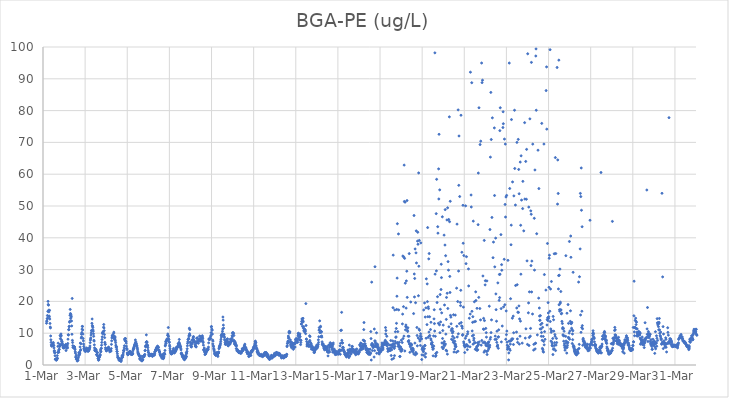
| Category | BGA-PE (ug/L) |
|---|---|
| 44621.166666666664 | 13.14 |
| 44621.177083333336 | 13.82 |
| 44621.1875 | 13.76 |
| 44621.197916666664 | 14.58 |
| 44621.208333333336 | 15.55 |
| 44621.21875 | 14.68 |
| 44621.229166666664 | 16.86 |
| 44621.239583333336 | 20.01 |
| 44621.25 | 19.02 |
| 44621.260416666664 | 18.82 |
| 44621.270833333336 | 17.22 |
| 44621.28125 | 16.7 |
| 44621.291666666664 | 15.41 |
| 44621.302083333336 | 15.15 |
| 44621.3125 | 17.2 |
| 44621.322916666664 | 14.45 |
| 44621.333333333336 | 13.07 |
| 44621.34375 | 11.94 |
| 44621.354166666664 | 11.66 |
| 44621.364583333336 | 9.13 |
| 44621.375 | 7.93 |
| 44621.385416666664 | 7.12 |
| 44621.395833333336 | 6.35 |
| 44621.40625 | 6.02 |
| 44621.416666666664 | 5.96 |
| 44621.427083333336 | 6.02 |
| 44621.4375 | 6.08 |
| 44621.447916666664 | 6.14 |
| 44621.458333333336 | 6.19 |
| 44621.46875 | 6.71 |
| 44621.479166666664 | 6.66 |
| 44621.489583333336 | 7.07 |
| 44621.5 | 6.17 |
| 44621.510416666664 | 6.14 |
| 44621.520833333336 | 5.37 |
| 44621.53125 | 4.37 |
| 44621.541666666664 | 4.5 |
| 44621.552083333336 | 3.82 |
| 44621.5625 | 3.89 |
| 44621.572916666664 | 2.91 |
| 44621.583333333336 | 1.82 |
| 44621.59375 | 1.84 |
| 44621.604166666664 | 1.74 |
| 44621.614583333336 | 1.61 |
| 44621.625 | 1.85 |
| 44621.635416666664 | 1.49 |
| 44621.645833333336 | 1.9 |
| 44621.65625 | 1.72 |
| 44621.666666666664 | 2.05 |
| 44621.677083333336 | 2.95 |
| 44621.6875 | 2.1 |
| 44621.697916666664 | 3.96 |
| 44621.708333333336 | 5.86 |
| 44621.71875 | 6.87 |
| 44621.729166666664 | 4.01 |
| 44621.739583333336 | 4.44 |
| 44621.75 | 3.99 |
| 44621.760416666664 | 4.83 |
| 44621.770833333336 | 4.95 |
| 44621.78125 | 5.85 |
| 44621.791666666664 | 5.84 |
| 44621.802083333336 | 6.48 |
| 44621.8125 | 9.28 |
| 44621.822916666664 | 8.28 |
| 44621.833333333336 | 6.27 |
| 44621.84375 | 8.97 |
| 44621.854166666664 | 9.76 |
| 44621.864583333336 | 9.25 |
| 44621.875 | 7.9 |
| 44621.885416666664 | 7.32 |
| 44621.895833333336 | 6.55 |
| 44621.90625 | 7.42 |
| 44621.916666666664 | 6.87 |
| 44621.927083333336 | 6.52 |
| 44621.9375 | 6.11 |
| 44621.947916666664 | 5.97 |
| 44621.958333333336 | 5.48 |
| 44621.96875 | 5.38 |
| 44621.979166666664 | 5.56 |
| 44621.989583333336 | 5.62 |
| 44622.0 | 5.34 |
| 44622.010416666664 | 5.61 |
| 44622.020833333336 | 5.76 |
| 44622.03125 | 6.1 |
| 44622.041666666664 | 6.15 |
| 44622.052083333336 | 5.9 |
| 44622.0625 | 6.12 |
| 44622.072916666664 | 5.97 |
| 44622.083333333336 | 6.5 |
| 44622.09375 | 4.55 |
| 44622.104166666664 | 5.55 |
| 44622.114583333336 | 5.6 |
| 44622.125 | 5.36 |
| 44622.135416666664 | 5.36 |
| 44622.145833333336 | 5.78 |
| 44622.15625 | 6.28 |
| 44622.166666666664 | 5.39 |
| 44622.177083333336 | 6.78 |
| 44622.1875 | 8.12 |
| 44622.197916666664 | 9.51 |
| 44622.208333333336 | 9.44 |
| 44622.21875 | 11.09 |
| 44622.229166666664 | 11.16 |
| 44622.239583333336 | 12.06 |
| 44622.25 | 12.17 |
| 44622.260416666664 | 13.46 |
| 44622.270833333336 | 13.74 |
| 44622.28125 | 15.63 |
| 44622.291666666664 | 17.48 |
| 44622.302083333336 | 16.19 |
| 44622.3125 | 14.64 |
| 44622.322916666664 | 15.94 |
| 44622.333333333336 | 15.03 |
| 44622.34375 | 15.36 |
| 44622.354166666664 | 13.84 |
| 44622.364583333336 | 12.29 |
| 44622.375 | 9.66 |
| 44622.385416666664 | 20.93 |
| 44622.395833333336 | 7.75 |
| 44622.40625 | 7.08 |
| 44622.416666666664 | 6.08 |
| 44622.427083333336 | 5.57 |
| 44622.4375 | 5.59 |
| 44622.447916666664 | 5.43 |
| 44622.458333333336 | 5.79 |
| 44622.46875 | 5.61 |
| 44622.479166666664 | 5.77 |
| 44622.489583333336 | 5.7 |
| 44622.5 | 5.64 |
| 44622.510416666664 | 5.07 |
| 44622.520833333336 | 4.86 |
| 44622.53125 | 4.16 |
| 44622.541666666664 | 3.73 |
| 44622.552083333336 | 2.49 |
| 44622.5625 | 2.49 |
| 44622.572916666664 | 3.1 |
| 44622.583333333336 | 1.8 |
| 44622.59375 | 2.07 |
| 44622.604166666664 | 1.9 |
| 44622.614583333336 | 1.9 |
| 44622.625 | 1.24 |
| 44622.635416666664 | 1.73 |
| 44622.645833333336 | 1.49 |
| 44622.65625 | 1.97 |
| 44622.666666666664 | 1.52 |
| 44622.677083333336 | 2.36 |
| 44622.6875 | 2.87 |
| 44622.697916666664 | 3.84 |
| 44622.708333333336 | 3.32 |
| 44622.71875 | 3.41 |
| 44622.729166666664 | 3.17 |
| 44622.739583333336 | 4.06 |
| 44622.75 | 3.73 |
| 44622.760416666664 | 5.67 |
| 44622.770833333336 | 6.89 |
| 44622.78125 | 4.6 |
| 44622.791666666664 | 4.83 |
| 44622.802083333336 | 6.67 |
| 44622.8125 | 8.48 |
| 44622.822916666664 | 9.7 |
| 44622.833333333336 | 8.81 |
| 44622.84375 | 10.22 |
| 44622.854166666664 | 11.28 |
| 44622.864583333336 | 12.15 |
| 44622.875 | 12.11 |
| 44622.885416666664 | 11.02 |
| 44622.895833333336 | 9.72 |
| 44622.90625 | 8.33 |
| 44622.916666666664 | 7.59 |
| 44622.927083333336 | 6.59 |
| 44622.9375 | 5.86 |
| 44622.947916666664 | 5.23 |
| 44622.958333333336 | 5.1 |
| 44622.96875 | 4.8 |
| 44622.979166666664 | 4.44 |
| 44622.989583333336 | 4.49 |
| 44623.0 | 5.07 |
| 44623.010416666664 | 5.01 |
| 44623.020833333336 | 4.23 |
| 44623.03125 | 4.49 |
| 44623.041666666664 | 4.61 |
| 44623.052083333336 | 4.63 |
| 44623.0625 | 4.55 |
| 44623.072916666664 | 5.35 |
| 44623.083333333336 | 5.06 |
| 44623.09375 | 4.83 |
| 44623.104166666664 | 4.59 |
| 44623.114583333336 | 4.55 |
| 44623.125 | 4.37 |
| 44623.135416666664 | 4.78 |
| 44623.145833333336 | 4.29 |
| 44623.15625 | 4.55 |
| 44623.166666666664 | 4.7 |
| 44623.177083333336 | 4.55 |
| 44623.1875 | 5 |
| 44623.197916666664 | 5.41 |
| 44623.208333333336 | 5.02 |
| 44623.21875 | 5.45 |
| 44623.229166666664 | 5.98 |
| 44623.239583333336 | 7.03 |
| 44623.25 | 7.82 |
| 44623.260416666664 | 8.21 |
| 44623.270833333336 | 8.53 |
| 44623.28125 | 9.42 |
| 44623.291666666664 | 10.09 |
| 44623.302083333336 | 10.76 |
| 44623.3125 | 10.92 |
| 44623.322916666664 | 13.1 |
| 44623.333333333336 | 14.47 |
| 44623.34375 | 12.4 |
| 44623.354166666664 | 12.16 |
| 44623.364583333336 | 11.79 |
| 44623.375 | 11.02 |
| 44623.385416666664 | 10.64 |
| 44623.395833333336 | 9.81 |
| 44623.40625 | 9.03 |
| 44623.416666666664 | 7.78 |
| 44623.427083333336 | 7.5 |
| 44623.4375 | 6.34 |
| 44623.447916666664 | 5.38 |
| 44623.458333333336 | 4.73 |
| 44623.46875 | 4.56 |
| 44623.479166666664 | 4.47 |
| 44623.489583333336 | 4.51 |
| 44623.5 | 4.7 |
| 44623.510416666664 | 4.96 |
| 44623.520833333336 | 4.77 |
| 44623.53125 | 4.41 |
| 44623.541666666664 | 3.22 |
| 44623.552083333336 | 3.32 |
| 44623.5625 | 4.04 |
| 44623.572916666664 | 3.94 |
| 44623.583333333336 | 3.85 |
| 44623.59375 | 2.87 |
| 44623.604166666664 | 2.71 |
| 44623.614583333336 | 2.04 |
| 44623.625 | 2.01 |
| 44623.635416666664 | 1.48 |
| 44623.645833333336 | 2.15 |
| 44623.65625 | 1.71 |
| 44623.666666666664 | 2.4 |
| 44623.677083333336 | 2.67 |
| 44623.6875 | 2.58 |
| 44623.697916666664 | 2.87 |
| 44623.708333333336 | 3.3 |
| 44623.71875 | 3.1 |
| 44623.729166666664 | 4.72 |
| 44623.739583333336 | 4.11 |
| 44623.75 | 4.3 |
| 44623.760416666664 | 5.16 |
| 44623.770833333336 | 5.27 |
| 44623.78125 | 6.22 |
| 44623.791666666664 | 7.1 |
| 44623.802083333336 | 8.02 |
| 44623.8125 | 8.86 |
| 44623.822916666664 | 9.88 |
| 44623.833333333336 | 10.27 |
| 44623.84375 | 10.06 |
| 44623.854166666664 | 10.14 |
| 44623.864583333336 | 10.54 |
| 44623.875 | 11.88 |
| 44623.885416666664 | 12.74 |
| 44623.895833333336 | 11.64 |
| 44623.90625 | 10.78 |
| 44623.916666666664 | 9.57 |
| 44623.927083333336 | 8.61 |
| 44623.9375 | 7.11 |
| 44623.947916666664 | 6.56 |
| 44623.958333333336 | 6.47 |
| 44623.96875 | 5.43 |
| 44623.979166666664 | 4.98 |
| 44623.989583333336 | 4.92 |
| 44624.0 | 4.45 |
| 44624.010416666664 | 4.72 |
| 44624.020833333336 | 4.48 |
| 44624.03125 | 4.73 |
| 44624.041666666664 | 5.05 |
| 44624.052083333336 | 5.1 |
| 44624.0625 | 5.19 |
| 44624.072916666664 | 5.33 |
| 44624.083333333336 | 5.18 |
| 44624.09375 | 5.2 |
| 44624.104166666664 | 5.26 |
| 44624.114583333336 | 5.64 |
| 44624.125 | 4.93 |
| 44624.135416666664 | 5.11 |
| 44624.145833333336 | 5.01 |
| 44624.15625 | 4.77 |
| 44624.166666666664 | 4.16 |
| 44624.177083333336 | 4.48 |
| 44624.1875 | 4.52 |
| 44624.197916666664 | 4.61 |
| 44624.208333333336 | 4.4 |
| 44624.21875 | 4.65 |
| 44624.229166666664 | 4.36 |
| 44624.239583333336 | 5.17 |
| 44624.25 | 6.48 |
| 44624.260416666664 | 7.6 |
| 44624.270833333336 | 8.51 |
| 44624.28125 | 9.14 |
| 44624.291666666664 | 8.74 |
| 44624.302083333336 | 9.27 |
| 44624.3125 | 9.42 |
| 44624.322916666664 | 9.12 |
| 44624.333333333336 | 9.26 |
| 44624.34375 | 8.71 |
| 44624.354166666664 | 9.97 |
| 44624.364583333336 | 10.32 |
| 44624.375 | 8.7 |
| 44624.385416666664 | 9.07 |
| 44624.395833333336 | 8.04 |
| 44624.40625 | 8.38 |
| 44624.416666666664 | 7.98 |
| 44624.427083333336 | 8.79 |
| 44624.4375 | 7.6 |
| 44624.447916666664 | 7.03 |
| 44624.458333333336 | 6.22 |
| 44624.46875 | 5.68 |
| 44624.479166666664 | 5.62 |
| 44624.489583333336 | 5.72 |
| 44624.5 | 4.98 |
| 44624.510416666664 | 4.28 |
| 44624.520833333336 | 4.22 |
| 44624.53125 | 3.53 |
| 44624.541666666664 | 2.85 |
| 44624.552083333336 | 2.4 |
| 44624.5625 | 2.43 |
| 44624.572916666664 | 2.17 |
| 44624.583333333336 | 2.1 |
| 44624.59375 | 2.1 |
| 44624.604166666664 | 1.77 |
| 44624.614583333336 | 1.52 |
| 44624.625 | 1.45 |
| 44624.635416666664 | 1.83 |
| 44624.645833333336 | 1.55 |
| 44624.65625 | 1.68 |
| 44624.666666666664 | 1.57 |
| 44624.677083333336 | 1.29 |
| 44624.6875 | 1.44 |
| 44624.697916666664 | 1.47 |
| 44624.708333333336 | 1.11 |
| 44624.71875 | 1.58 |
| 44624.729166666664 | 2.06 |
| 44624.739583333336 | 2.28 |
| 44624.75 | 2.76 |
| 44624.760416666664 | 2.92 |
| 44624.770833333336 | 2.48 |
| 44624.78125 | 2.5 |
| 44624.791666666664 | 3.21 |
| 44624.802083333336 | 3.12 |
| 44624.8125 | 3.8 |
| 44624.822916666664 | 4.59 |
| 44624.833333333336 | 4.42 |
| 44624.84375 | 4.61 |
| 44624.854166666664 | 5.37 |
| 44624.864583333336 | 6.05 |
| 44624.875 | 8.02 |
| 44624.885416666664 | 8.23 |
| 44624.895833333336 | 7.65 |
| 44624.90625 | 8.28 |
| 44624.916666666664 | 8.33 |
| 44624.927083333336 | 7.51 |
| 44624.9375 | 7.44 |
| 44624.947916666664 | 6.88 |
| 44624.958333333336 | 5.93 |
| 44624.96875 | 5.16 |
| 44624.979166666664 | 5.16 |
| 44624.989583333336 | 4.85 |
| 44625.0 | 3.81 |
| 44625.010416666664 | 3.6 |
| 44625.020833333336 | 3.24 |
| 44625.03125 | 3.31 |
| 44625.041666666664 | 3.26 |
| 44625.052083333336 | 3.76 |
| 44625.0625 | 3.74 |
| 44625.072916666664 | 3.6 |
| 44625.083333333336 | 3.97 |
| 44625.09375 | 3.74 |
| 44625.104166666664 | 4.26 |
| 44625.114583333336 | 4.02 |
| 44625.125 | 4.15 |
| 44625.135416666664 | 4.25 |
| 44625.145833333336 | 3.85 |
| 44625.15625 | 4.12 |
| 44625.166666666664 | 3.9 |
| 44625.177083333336 | 3.45 |
| 44625.1875 | 3.32 |
| 44625.197916666664 | 3.35 |
| 44625.208333333336 | 3.57 |
| 44625.21875 | 3.54 |
| 44625.229166666664 | 3.37 |
| 44625.239583333336 | 3.46 |
| 44625.25 | 3.38 |
| 44625.260416666664 | 3.7 |
| 44625.270833333336 | 4.47 |
| 44625.28125 | 4.99 |
| 44625.291666666664 | 4.99 |
| 44625.302083333336 | 5.34 |
| 44625.3125 | 5.2 |
| 44625.322916666664 | 5.65 |
| 44625.333333333336 | 5.9 |
| 44625.34375 | 6.28 |
| 44625.354166666664 | 6.09 |
| 44625.364583333336 | 6.49 |
| 44625.375 | 6.85 |
| 44625.385416666664 | 7.88 |
| 44625.395833333336 | 6.94 |
| 44625.40625 | 7.29 |
| 44625.416666666664 | 6.81 |
| 44625.427083333336 | 6.82 |
| 44625.4375 | 6.28 |
| 44625.447916666664 | 6.1 |
| 44625.458333333336 | 5.96 |
| 44625.46875 | 5.53 |
| 44625.479166666664 | 5.21 |
| 44625.489583333336 | 4.75 |
| 44625.5 | 4.14 |
| 44625.510416666664 | 3.83 |
| 44625.520833333336 | 3.63 |
| 44625.53125 | 3.37 |
| 44625.541666666664 | 3.48 |
| 44625.552083333336 | 3.14 |
| 44625.5625 | 2.89 |
| 44625.572916666664 | 2.86 |
| 44625.583333333336 | 2.9 |
| 44625.59375 | 2.1 |
| 44625.604166666664 | 1.79 |
| 44625.614583333336 | 1.86 |
| 44625.625 | 1.8 |
| 44625.635416666664 | 2.35 |
| 44625.645833333336 | 2.82 |
| 44625.65625 | 1.64 |
| 44625.666666666664 | 1.43 |
| 44625.677083333336 | 1.5 |
| 44625.6875 | 1.55 |
| 44625.697916666664 | 1.26 |
| 44625.708333333336 | 1.62 |
| 44625.71875 | 1.66 |
| 44625.729166666664 | 1.68 |
| 44625.739583333336 | 1.61 |
| 44625.75 | 2.71 |
| 44625.760416666664 | 2.43 |
| 44625.770833333336 | 2.73 |
| 44625.78125 | 2.87 |
| 44625.791666666664 | 2.7 |
| 44625.802083333336 | 2.63 |
| 44625.8125 | 3.12 |
| 44625.822916666664 | 3.13 |
| 44625.833333333336 | 3.34 |
| 44625.84375 | 4.5 |
| 44625.854166666664 | 4.61 |
| 44625.864583333336 | 5.91 |
| 44625.875 | 5.68 |
| 44625.885416666664 | 6.13 |
| 44625.895833333336 | 7.1 |
| 44625.90625 | 9.47 |
| 44625.916666666664 | 7.32 |
| 44625.927083333336 | 7.33 |
| 44625.9375 | 7.06 |
| 44625.947916666664 | 6.22 |
| 44625.958333333336 | 6.24 |
| 44625.96875 | 6.02 |
| 44625.979166666664 | 5.45 |
| 44625.989583333336 | 4.62 |
| 44626.0 | 4.05 |
| 44626.010416666664 | 3.9 |
| 44626.020833333336 | 3.36 |
| 44626.03125 | 2.9 |
| 44626.041666666664 | 2.9 |
| 44626.052083333336 | 3.01 |
| 44626.0625 | 2.93 |
| 44626.072916666664 | 2.99 |
| 44626.083333333336 | 3.31 |
| 44626.09375 | 3.31 |
| 44626.104166666664 | 3.27 |
| 44626.114583333336 | 3.16 |
| 44626.125 | 3.28 |
| 44626.135416666664 | 3.33 |
| 44626.145833333336 | 3.39 |
| 44626.15625 | 3.12 |
| 44626.166666666664 | 3.14 |
| 44626.177083333336 | 3.28 |
| 44626.1875 | 2.73 |
| 44626.197916666664 | 2.93 |
| 44626.208333333336 | 2.78 |
| 44626.21875 | 3.19 |
| 44626.229166666664 | 3.4 |
| 44626.239583333336 | 3.42 |
| 44626.25 | 3.26 |
| 44626.260416666664 | 3.37 |
| 44626.270833333336 | 3.39 |
| 44626.28125 | 3.36 |
| 44626.291666666664 | 3.08 |
| 44626.302083333336 | 3.65 |
| 44626.3125 | 4.2 |
| 44626.322916666664 | 4.19 |
| 44626.333333333336 | 4.37 |
| 44626.34375 | 4.86 |
| 44626.354166666664 | 4.72 |
| 44626.364583333336 | 4.59 |
| 44626.375 | 4.87 |
| 44626.385416666664 | 5.45 |
| 44626.395833333336 | 5.2 |
| 44626.40625 | 5.3 |
| 44626.416666666664 | 5.68 |
| 44626.427083333336 | 5.48 |
| 44626.4375 | 5.95 |
| 44626.447916666664 | 5.58 |
| 44626.458333333336 | 5.64 |
| 44626.46875 | 5.6 |
| 44626.479166666664 | 5.56 |
| 44626.489583333336 | 4.66 |
| 44626.5 | 4.69 |
| 44626.510416666664 | 4.71 |
| 44626.520833333336 | 4.17 |
| 44626.53125 | 4.24 |
| 44626.541666666664 | 4.07 |
| 44626.552083333336 | 3.49 |
| 44626.5625 | 3.41 |
| 44626.572916666664 | 3.1 |
| 44626.583333333336 | 3.12 |
| 44626.59375 | 2.94 |
| 44626.604166666664 | 2.63 |
| 44626.614583333336 | 2.86 |
| 44626.625 | 2.84 |
| 44626.635416666664 | 3.01 |
| 44626.645833333336 | 2.12 |
| 44626.65625 | 2.73 |
| 44626.666666666664 | 2.5 |
| 44626.677083333336 | 3.34 |
| 44626.6875 | 3.07 |
| 44626.697916666664 | 2.48 |
| 44626.708333333336 | 1.98 |
| 44626.71875 | 2.12 |
| 44626.729166666664 | 2.32 |
| 44626.739583333336 | 2.61 |
| 44626.75 | 3.35 |
| 44626.760416666664 | 3.75 |
| 44626.770833333336 | 3.55 |
| 44626.78125 | 3.36 |
| 44626.791666666664 | 4.58 |
| 44626.802083333336 | 6 |
| 44626.8125 | 6.26 |
| 44626.822916666664 | 7.32 |
| 44626.833333333336 | 6.8 |
| 44626.84375 | 6.89 |
| 44626.854166666664 | 7.64 |
| 44626.864583333336 | 7.6 |
| 44626.875 | 7.94 |
| 44626.885416666664 | 7.75 |
| 44626.895833333336 | 8.26 |
| 44626.90625 | 8.04 |
| 44626.916666666664 | 9.34 |
| 44626.927083333336 | 9.75 |
| 44626.9375 | 9.26 |
| 44626.947916666664 | 11.78 |
| 44626.958333333336 | 8.94 |
| 44626.96875 | 8.15 |
| 44626.979166666664 | 8 |
| 44626.989583333336 | 7.27 |
| 44627.0 | 7.09 |
| 44627.010416666664 | 6.23 |
| 44627.020833333336 | 5.78 |
| 44627.03125 | 5.13 |
| 44627.041666666664 | 4.57 |
| 44627.052083333336 | 4.09 |
| 44627.0625 | 4.02 |
| 44627.072916666664 | 3.64 |
| 44627.083333333336 | 3.58 |
| 44627.09375 | 3.45 |
| 44627.104166666664 | 3.54 |
| 44627.114583333336 | 3.8 |
| 44627.125 | 3.72 |
| 44627.135416666664 | 3.61 |
| 44627.145833333336 | 3.81 |
| 44627.15625 | 4.08 |
| 44627.166666666664 | 4.62 |
| 44627.177083333336 | 4.21 |
| 44627.1875 | 4.33 |
| 44627.197916666664 | 5.21 |
| 44627.208333333336 | 4.39 |
| 44627.21875 | 3.8 |
| 44627.229166666664 | 3.89 |
| 44627.239583333336 | 3.82 |
| 44627.25 | 4.33 |
| 44627.260416666664 | 4.54 |
| 44627.270833333336 | 4.04 |
| 44627.28125 | 4.3 |
| 44627.291666666664 | 4.34 |
| 44627.302083333336 | 4.83 |
| 44627.3125 | 4.59 |
| 44627.322916666664 | 5.42 |
| 44627.333333333336 | 5.47 |
| 44627.34375 | 5.01 |
| 44627.354166666664 | 5.45 |
| 44627.364583333336 | 5.69 |
| 44627.375 | 5.64 |
| 44627.385416666664 | 5.51 |
| 44627.395833333336 | 5.92 |
| 44627.40625 | 5.77 |
| 44627.416666666664 | 6.67 |
| 44627.427083333336 | 6.65 |
| 44627.4375 | 6.28 |
| 44627.447916666664 | 6.79 |
| 44627.458333333336 | 7.11 |
| 44627.46875 | 8.04 |
| 44627.479166666664 | 6.78 |
| 44627.489583333336 | 6.22 |
| 44627.5 | 6.32 |
| 44627.510416666664 | 5.77 |
| 44627.520833333336 | 5.6 |
| 44627.53125 | 5.88 |
| 44627.541666666664 | 5.18 |
| 44627.552083333336 | 4.76 |
| 44627.5625 | 3.64 |
| 44627.572916666664 | 3.78 |
| 44627.583333333336 | 3.31 |
| 44627.59375 | 3.48 |
| 44627.604166666664 | 3.11 |
| 44627.614583333336 | 2.58 |
| 44627.625 | 2.92 |
| 44627.635416666664 | 3 |
| 44627.645833333336 | 2.53 |
| 44627.65625 | 2.83 |
| 44627.666666666664 | 2.6 |
| 44627.677083333336 | 1.97 |
| 44627.6875 | 1.97 |
| 44627.697916666664 | 1.88 |
| 44627.708333333336 | 1.96 |
| 44627.71875 | 1.66 |
| 44627.729166666664 | 2.45 |
| 44627.739583333336 | 2.68 |
| 44627.75 | 2.23 |
| 44627.760416666664 | 2.04 |
| 44627.770833333336 | 2.45 |
| 44627.78125 | 2.26 |
| 44627.791666666664 | 3.22 |
| 44627.802083333336 | 3.85 |
| 44627.8125 | 2.66 |
| 44627.822916666664 | 3.74 |
| 44627.833333333336 | 4.29 |
| 44627.84375 | 5.1 |
| 44627.854166666664 | 6.04 |
| 44627.864583333336 | 6.79 |
| 44627.875 | 7.28 |
| 44627.885416666664 | 7.99 |
| 44627.895833333336 | 8.04 |
| 44627.90625 | 8.21 |
| 44627.916666666664 | 8.42 |
| 44627.927083333336 | 9.1 |
| 44627.9375 | 9.37 |
| 44627.947916666664 | 11.56 |
| 44627.958333333336 | 9.85 |
| 44627.96875 | 11.12 |
| 44627.979166666664 | 9.35 |
| 44627.989583333336 | 7.23 |
| 44628.0 | 6.2 |
| 44628.010416666664 | 6.94 |
| 44628.020833333336 | 6.9 |
| 44628.03125 | 5.79 |
| 44628.041666666664 | 5.64 |
| 44628.052083333336 | 5.87 |
| 44628.0625 | 6.53 |
| 44628.072916666664 | 7.83 |
| 44628.083333333336 | 7.9 |
| 44628.09375 | 6.89 |
| 44628.104166666664 | 7.16 |
| 44628.114583333336 | 7.97 |
| 44628.125 | 8.77 |
| 44628.135416666664 | 8.5 |
| 44628.145833333336 | 8.94 |
| 44628.15625 | 7.87 |
| 44628.166666666664 | 7.64 |
| 44628.177083333336 | 7.55 |
| 44628.1875 | 7.23 |
| 44628.197916666664 | 7.31 |
| 44628.208333333336 | 7.26 |
| 44628.21875 | 6.43 |
| 44628.229166666664 | 5.95 |
| 44628.239583333336 | 6.05 |
| 44628.25 | 5.79 |
| 44628.260416666664 | 5.85 |
| 44628.270833333336 | 5.67 |
| 44628.28125 | 6.83 |
| 44628.291666666664 | 7.25 |
| 44628.302083333336 | 8.38 |
| 44628.3125 | 8.44 |
| 44628.322916666664 | 8.55 |
| 44628.333333333336 | 7.53 |
| 44628.34375 | 7.24 |
| 44628.354166666664 | 7.19 |
| 44628.364583333336 | 6.91 |
| 44628.375 | 6.87 |
| 44628.385416666664 | 7.61 |
| 44628.395833333336 | 7.78 |
| 44628.40625 | 8.04 |
| 44628.416666666664 | 7.65 |
| 44628.427083333336 | 8 |
| 44628.4375 | 9.06 |
| 44628.447916666664 | 9.08 |
| 44628.458333333336 | 8.2 |
| 44628.46875 | 7.57 |
| 44628.479166666664 | 7.58 |
| 44628.489583333336 | 7.74 |
| 44628.5 | 7.64 |
| 44628.510416666664 | 7.56 |
| 44628.520833333336 | 8.55 |
| 44628.53125 | 8.56 |
| 44628.541666666664 | 8.42 |
| 44628.552083333336 | 8.95 |
| 44628.5625 | 9.2 |
| 44628.572916666664 | 8.72 |
| 44628.583333333336 | 8.26 |
| 44628.59375 | 7.44 |
| 44628.604166666664 | 7.03 |
| 44628.614583333336 | 6.25 |
| 44628.625 | 4.7 |
| 44628.635416666664 | 4.9 |
| 44628.645833333336 | 4.76 |
| 44628.65625 | 5.34 |
| 44628.666666666664 | 4.32 |
| 44628.677083333336 | 3.92 |
| 44628.6875 | 3.27 |
| 44628.697916666664 | 4.17 |
| 44628.708333333336 | 3.47 |
| 44628.71875 | 3.8 |
| 44628.729166666664 | 3.53 |
| 44628.739583333336 | 4.19 |
| 44628.75 | 3.97 |
| 44628.760416666664 | 4.92 |
| 44628.770833333336 | 4.41 |
| 44628.78125 | 4.56 |
| 44628.791666666664 | 4.56 |
| 44628.802083333336 | 4.79 |
| 44628.8125 | 4.72 |
| 44628.822916666664 | 4.72 |
| 44628.833333333336 | 4.99 |
| 44628.84375 | 5.01 |
| 44628.854166666664 | 5.63 |
| 44628.864583333336 | 6.96 |
| 44628.875 | 8.14 |
| 44628.885416666664 | 8.21 |
| 44628.895833333336 | 8.03 |
| 44628.90625 | 7.98 |
| 44628.916666666664 | 8.36 |
| 44628.927083333336 | 8.22 |
| 44628.9375 | 8.3 |
| 44628.947916666664 | 8.36 |
| 44628.958333333336 | 8.94 |
| 44628.96875 | 9.33 |
| 44628.979166666664 | 10.18 |
| 44628.989583333336 | 12.01 |
| 44629.0 | 12.11 |
| 44629.010416666664 | 11.3 |
| 44629.020833333336 | 10.91 |
| 44629.03125 | 11.03 |
| 44629.041666666664 | 9.73 |
| 44629.052083333336 | 7.85 |
| 44629.0625 | 6.63 |
| 44629.072916666664 | 7.51 |
| 44629.083333333336 | 6.04 |
| 44629.09375 | 5.76 |
| 44629.104166666664 | 5.18 |
| 44629.114583333336 | 4.86 |
| 44629.125 | 4.65 |
| 44629.135416666664 | 4.22 |
| 44629.145833333336 | 3.72 |
| 44629.15625 | 3.5 |
| 44629.166666666664 | 3.39 |
| 44629.177083333336 | 3.35 |
| 44629.1875 | 3.26 |
| 44629.197916666664 | 3.15 |
| 44629.208333333336 | 3 |
| 44629.21875 | 3.38 |
| 44629.229166666664 | 3.45 |
| 44629.239583333336 | 3.83 |
| 44629.25 | 3.7 |
| 44629.260416666664 | 3.85 |
| 44629.270833333336 | 3.25 |
| 44629.28125 | 3.05 |
| 44629.291666666664 | 3.03 |
| 44629.302083333336 | 2.69 |
| 44629.3125 | 3.96 |
| 44629.322916666664 | 3.66 |
| 44629.333333333336 | 3.77 |
| 44629.34375 | 4.12 |
| 44629.354166666664 | 5.13 |
| 44629.364583333336 | 5.37 |
| 44629.375 | 5.74 |
| 44629.385416666664 | 6.03 |
| 44629.395833333336 | 5.64 |
| 44629.40625 | 6.11 |
| 44629.416666666664 | 6.43 |
| 44629.427083333336 | 6.86 |
| 44629.4375 | 7.45 |
| 44629.447916666664 | 8.09 |
| 44629.458333333336 | 9.3 |
| 44629.46875 | 8.78 |
| 44629.479166666664 | 9.48 |
| 44629.489583333336 | 9.17 |
| 44629.5 | 9.3 |
| 44629.510416666664 | 9.9 |
| 44629.520833333336 | 10.6 |
| 44629.53125 | 11.34 |
| 44629.541666666664 | 15.09 |
| 44629.552083333336 | 14.12 |
| 44629.5625 | 12.55 |
| 44629.572916666664 | 11.6 |
| 44629.583333333336 | 9.69 |
| 44629.59375 | 9.5 |
| 44629.604166666664 | 8.97 |
| 44629.614583333336 | 8.61 |
| 44629.625 | 7.97 |
| 44629.635416666664 | 7.78 |
| 44629.645833333336 | 7.08 |
| 44629.65625 | 6.48 |
| 44629.666666666664 | 6.75 |
| 44629.677083333336 | 6.56 |
| 44629.6875 | 6.51 |
| 44629.697916666664 | 7.44 |
| 44629.708333333336 | 7.95 |
| 44629.71875 | 7.83 |
| 44629.729166666664 | 7.86 |
| 44629.739583333336 | 8.11 |
| 44629.75 | 7.14 |
| 44629.760416666664 | 8.23 |
| 44629.770833333336 | 7.41 |
| 44629.78125 | 6.16 |
| 44629.791666666664 | 6.01 |
| 44629.802083333336 | 6.71 |
| 44629.8125 | 6.21 |
| 44629.822916666664 | 6.56 |
| 44629.833333333336 | 6.82 |
| 44629.84375 | 7.25 |
| 44629.854166666664 | 6.92 |
| 44629.864583333336 | 6.61 |
| 44629.875 | 6.54 |
| 44629.885416666664 | 6.87 |
| 44629.895833333336 | 8.15 |
| 44629.90625 | 7.1 |
| 44629.916666666664 | 7.88 |
| 44629.927083333336 | 7.32 |
| 44629.9375 | 7.48 |
| 44629.947916666664 | 7.87 |
| 44629.958333333336 | 7.58 |
| 44629.96875 | 8.33 |
| 44629.979166666664 | 9.22 |
| 44629.989583333336 | 8.84 |
| 44630.0 | 10.18 |
| 44630.010416666664 | 9.93 |
| 44630.020833333336 | 9.91 |
| 44630.03125 | 10.17 |
| 44630.041666666664 | 9.89 |
| 44630.052083333336 | 7.77 |
| 44630.0625 | 9.28 |
| 44630.072916666664 | 7.33 |
| 44630.083333333336 | 7.57 |
| 44630.09375 | 6.64 |
| 44630.104166666664 | 6.63 |
| 44630.114583333336 | 6.53 |
| 44630.125 | 7.2 |
| 44630.135416666664 | 6.85 |
| 44630.145833333336 | 6.09 |
| 44630.15625 | 6.4 |
| 44630.166666666664 | 6.26 |
| 44630.177083333336 | 5.17 |
| 44630.1875 | 6 |
| 44630.197916666664 | 5.1 |
| 44630.208333333336 | 4.45 |
| 44630.21875 | 4.62 |
| 44630.229166666664 | 4.6 |
| 44630.239583333336 | 4.58 |
| 44630.25 | 4.4 |
| 44630.260416666664 | 4.53 |
| 44630.270833333336 | 4.17 |
| 44630.28125 | 4.34 |
| 44630.291666666664 | 3.94 |
| 44630.302083333336 | 3.87 |
| 44630.3125 | 4.14 |
| 44630.322916666664 | 4.19 |
| 44630.333333333336 | 3.92 |
| 44630.34375 | 4.02 |
| 44630.354166666664 | 3.76 |
| 44630.364583333336 | 3.85 |
| 44630.375 | 4.08 |
| 44630.385416666664 | 3.68 |
| 44630.395833333336 | 4.12 |
| 44630.40625 | 3.76 |
| 44630.416666666664 | 3.88 |
| 44630.427083333336 | 4.14 |
| 44630.4375 | 4.33 |
| 44630.447916666664 | 4.63 |
| 44630.458333333336 | 5.06 |
| 44630.46875 | 5.17 |
| 44630.479166666664 | 4.94 |
| 44630.489583333336 | 4.47 |
| 44630.5 | 4.84 |
| 44630.510416666664 | 4.7 |
| 44630.520833333336 | 4.99 |
| 44630.53125 | 5.16 |
| 44630.541666666664 | 5.28 |
| 44630.552083333336 | 5.71 |
| 44630.5625 | 6.08 |
| 44630.572916666664 | 6.24 |
| 44630.583333333336 | 6.55 |
| 44630.59375 | 5.65 |
| 44630.604166666664 | 5.3 |
| 44630.614583333336 | 5.32 |
| 44630.625 | 5.51 |
| 44630.635416666664 | 5.04 |
| 44630.645833333336 | 4.99 |
| 44630.65625 | 4.75 |
| 44630.666666666664 | 4.52 |
| 44630.677083333336 | 4.09 |
| 44630.6875 | 3.93 |
| 44630.697916666664 | 3.84 |
| 44630.708333333336 | 3.48 |
| 44630.71875 | 4 |
| 44630.729166666664 | 4.18 |
| 44630.739583333336 | 3.93 |
| 44630.75 | 3.83 |
| 44630.760416666664 | 3.36 |
| 44630.770833333336 | 2.65 |
| 44630.78125 | 2.77 |
| 44630.791666666664 | 3.25 |
| 44630.802083333336 | 3.21 |
| 44630.8125 | 3.52 |
| 44630.822916666664 | 3.04 |
| 44630.833333333336 | 3.47 |
| 44630.84375 | 2.99 |
| 44630.854166666664 | 3.08 |
| 44630.864583333336 | 3 |
| 44630.875 | 3.88 |
| 44630.885416666664 | 4.29 |
| 44630.895833333336 | 4.44 |
| 44630.90625 | 4.01 |
| 44630.916666666664 | 4.48 |
| 44630.927083333336 | 4.59 |
| 44630.9375 | 4.42 |
| 44630.947916666664 | 4.74 |
| 44630.958333333336 | 4.61 |
| 44630.96875 | 4.73 |
| 44630.979166666664 | 5.05 |
| 44630.989583333336 | 5.49 |
| 44631.0 | 5.2 |
| 44631.010416666664 | 5.73 |
| 44631.020833333336 | 5.3 |
| 44631.03125 | 5.76 |
| 44631.041666666664 | 6.02 |
| 44631.052083333336 | 6.33 |
| 44631.0625 | 6.82 |
| 44631.072916666664 | 7.36 |
| 44631.083333333336 | 7.52 |
| 44631.09375 | 7.08 |
| 44631.104166666664 | 6.99 |
| 44631.114583333336 | 6.14 |
| 44631.125 | 5.61 |
| 44631.135416666664 | 5.11 |
| 44631.145833333336 | 5.2 |
| 44631.15625 | 4.95 |
| 44631.166666666664 | 4.18 |
| 44631.177083333336 | 3.87 |
| 44631.1875 | 4.55 |
| 44631.197916666664 | 4.19 |
| 44631.208333333336 | 4.02 |
| 44631.21875 | 3.36 |
| 44631.229166666664 | 3.68 |
| 44631.239583333336 | 3.54 |
| 44631.25 | 3.57 |
| 44631.260416666664 | 3.2 |
| 44631.270833333336 | 3.1 |
| 44631.28125 | 2.98 |
| 44631.291666666664 | 3.25 |
| 44631.302083333336 | 3.2 |
| 44631.3125 | 3.04 |
| 44631.322916666664 | 2.97 |
| 44631.333333333336 | 2.92 |
| 44631.34375 | 3.13 |
| 44631.354166666664 | 2.97 |
| 44631.364583333336 | 2.87 |
| 44631.375 | 3.34 |
| 44631.385416666664 | 3.01 |
| 44631.395833333336 | 3.07 |
| 44631.40625 | 3.06 |
| 44631.416666666664 | 2.62 |
| 44631.427083333336 | 2.87 |
| 44631.4375 | 2.99 |
| 44631.447916666664 | 3.05 |
| 44631.458333333336 | 2.82 |
| 44631.46875 | 2.89 |
| 44631.479166666664 | 3.01 |
| 44631.489583333336 | 3.25 |
| 44631.5 | 3.61 |
| 44631.510416666664 | 3.59 |
| 44631.520833333336 | 3.21 |
| 44631.53125 | 3.95 |
| 44631.541666666664 | 3.61 |
| 44631.552083333336 | 3.7 |
| 44631.5625 | 3.09 |
| 44631.572916666664 | 3.6 |
| 44631.583333333336 | 3.84 |
| 44631.59375 | 3.95 |
| 44631.604166666664 | 3.46 |
| 44631.614583333336 | 3.56 |
| 44631.625 | 3.58 |
| 44631.635416666664 | 3.45 |
| 44631.645833333336 | 2.59 |
| 44631.65625 | 2.6 |
| 44631.666666666664 | 2.7 |
| 44631.677083333336 | 3.23 |
| 44631.6875 | 2.95 |
| 44631.697916666664 | 2.73 |
| 44631.708333333336 | 2.25 |
| 44631.71875 | 2.1 |
| 44631.729166666664 | 1.92 |
| 44631.739583333336 | 1.92 |
| 44631.75 | 1.79 |
| 44631.760416666664 | 1.76 |
| 44631.770833333336 | 2.02 |
| 44631.78125 | 2.03 |
| 44631.791666666664 | 2.18 |
| 44631.802083333336 | 2.47 |
| 44631.8125 | 2.43 |
| 44631.822916666664 | 2.53 |
| 44631.833333333336 | 2.77 |
| 44631.84375 | 3.01 |
| 44631.854166666664 | 3.02 |
| 44631.864583333336 | 2.12 |
| 44631.875 | 2.54 |
| 44631.885416666664 | 2.3 |
| 44631.895833333336 | 2.41 |
| 44631.90625 | 2.56 |
| 44631.916666666664 | 2.7 |
| 44631.927083333336 | 2.64 |
| 44631.9375 | 2.87 |
| 44631.947916666664 | 2.73 |
| 44631.958333333336 | 2.93 |
| 44631.96875 | 3.11 |
| 44631.979166666664 | 3.3 |
| 44631.989583333336 | 3.67 |
| 44632.0 | 2.77 |
| 44632.010416666664 | 3.41 |
| 44632.020833333336 | 3.07 |
| 44632.03125 | 3.35 |
| 44632.041666666664 | 3.05 |
| 44632.052083333336 | 3.45 |
| 44632.0625 | 3.6 |
| 44632.072916666664 | 3.94 |
| 44632.083333333336 | 3.68 |
| 44632.09375 | 3.94 |
| 44632.104166666664 | 3.85 |
| 44632.114583333336 | 3.57 |
| 44632.125 | 3.59 |
| 44632.135416666664 | 3.6 |
| 44632.145833333336 | 3.64 |
| 44632.15625 | 3.64 |
| 44632.166666666664 | 3.24 |
| 44632.177083333336 | 3.72 |
| 44632.1875 | 3.13 |
| 44632.197916666664 | 3.17 |
| 44632.208333333336 | 3.46 |
| 44632.21875 | 3.65 |
| 44632.229166666664 | 3.43 |
| 44632.239583333336 | 3.46 |
| 44632.25 | 3.39 |
| 44632.260416666664 | 3.15 |
| 44632.270833333336 | 3.04 |
| 44632.28125 | 2.87 |
| 44632.291666666664 | 2.91 |
| 44632.302083333336 | 2.57 |
| 44632.3125 | 2.59 |
| 44632.322916666664 | 2.2 |
| 44632.333333333336 | 2.46 |
| 44632.34375 | 2.42 |
| 44632.354166666664 | 2.49 |
| 44632.364583333336 | 2.48 |
| 44632.375 | 2.36 |
| 44632.385416666664 | 2.92 |
| 44632.395833333336 | 2.85 |
| 44632.40625 | 2.51 |
| 44632.416666666664 | 2.61 |
| 44632.427083333336 | 2.17 |
| 44632.4375 | 2.32 |
| 44632.447916666664 | 2.51 |
| 44632.458333333336 | 2.49 |
| 44632.46875 | 2.88 |
| 44632.479166666664 | 2.96 |
| 44632.489583333336 | 2.96 |
| 44632.5 | 2.87 |
| 44632.510416666664 | 2.79 |
| 44632.520833333336 | 2.59 |
| 44632.53125 | 3.02 |
| 44632.541666666664 | 2.89 |
| 44632.552083333336 | 2.76 |
| 44632.5625 | 3.33 |
| 44632.572916666664 | 3.35 |
| 44632.583333333336 | 5.79 |
| 44632.59375 | 6.06 |
| 44632.604166666664 | 6.76 |
| 44632.614583333336 | 6.9 |
| 44632.625 | 7.4 |
| 44632.635416666664 | 7.51 |
| 44632.645833333336 | 9.1 |
| 44632.65625 | 8.41 |
| 44632.666666666664 | 8.67 |
| 44632.677083333336 | 10.23 |
| 44632.6875 | 10.58 |
| 44632.697916666664 | 10.08 |
| 44632.708333333336 | 10.18 |
| 44632.71875 | 10.44 |
| 44632.729166666664 | 7.12 |
| 44632.739583333336 | 7.91 |
| 44632.75 | 6.33 |
| 44632.760416666664 | 6.99 |
| 44632.770833333336 | 7.34 |
| 44632.78125 | 5.87 |
| 44632.791666666664 | 5.83 |
| 44632.802083333336 | 5.42 |
| 44632.8125 | 6.14 |
| 44632.822916666664 | 6.6 |
| 44632.833333333336 | 6.86 |
| 44632.84375 | 6.89 |
| 44632.854166666664 | 6.1 |
| 44632.864583333336 | 6.83 |
| 44632.875 | 6.25 |
| 44632.885416666664 | 4.93 |
| 44632.895833333336 | 5.37 |
| 44632.90625 | 5.6 |
| 44632.916666666664 | 5.52 |
| 44632.927083333336 | 6.82 |
| 44632.9375 | 6.58 |
| 44632.947916666664 | 6.77 |
| 44632.958333333336 | 6.98 |
| 44632.96875 | 5.65 |
| 44632.979166666664 | 6.8 |
| 44632.989583333336 | 8.05 |
| 44633.0 | 7.58 |
| 44633.010416666664 | 7.92 |
| 44633.020833333336 | 8.32 |
| 44633.03125 | 7.96 |
| 44633.041666666664 | 7.33 |
| 44633.052083333336 | 7.97 |
| 44633.0625 | 7.17 |
| 44633.072916666664 | 7.55 |
| 44633.083333333336 | 7.12 |
| 44633.09375 | 8.19 |
| 44633.104166666664 | 9.15 |
| 44633.114583333336 | 9.84 |
| 44633.125 | 10.01 |
| 44633.135416666664 | 9.4 |
| 44633.145833333336 | 9.62 |
| 44633.15625 | 8.64 |
| 44633.166666666664 | 8.84 |
| 44633.177083333336 | 7.88 |
| 44633.1875 | 9.43 |
| 44633.197916666664 | 9.8 |
| 44633.208333333336 | 8.9 |
| 44633.21875 | 7.94 |
| 44633.229166666664 | 6.41 |
| 44633.239583333336 | 7.08 |
| 44633.25 | 7.74 |
| 44633.260416666664 | 12.89 |
| 44633.270833333336 | 12.89 |
| 44633.28125 | 13.71 |
| 44633.291666666664 | 14.48 |
| 44633.302083333336 | 13.53 |
| 44633.3125 | 14.5 |
| 44633.322916666664 | 12.13 |
| 44633.333333333336 | 13.93 |
| 44633.34375 | 14.69 |
| 44633.354166666664 | 13.59 |
| 44633.364583333336 | 11.55 |
| 44633.375 | 12.04 |
| 44633.385416666664 | 10.7 |
| 44633.395833333336 | 10.92 |
| 44633.40625 | 10.92 |
| 44633.416666666664 | 11.28 |
| 44633.427083333336 | 10.38 |
| 44633.4375 | 10.82 |
| 44633.447916666664 | 11.09 |
| 44633.458333333336 | 10.64 |
| 44633.46875 | 9.86 |
| 44633.479166666664 | 19.31 |
| 44633.489583333336 | 12.43 |
| 44633.5 | 8.15 |
| 44633.510416666664 | 8.12 |
| 44633.520833333336 | 7.35 |
| 44633.53125 | 5.94 |
| 44633.541666666664 | 6.42 |
| 44633.552083333336 | 6.83 |
| 44633.5625 | 6.62 |
| 44633.572916666664 | 6.1 |
| 44633.583333333336 | 6.49 |
| 44633.59375 | 6.25 |
| 44633.604166666664 | 6.34 |
| 44633.614583333336 | 5.84 |
| 44633.625 | 6.08 |
| 44633.635416666664 | 7.28 |
| 44633.645833333336 | 7.31 |
| 44633.65625 | 9.18 |
| 44633.666666666664 | 7.72 |
| 44633.677083333336 | 8.95 |
| 44633.6875 | 5.78 |
| 44633.697916666664 | 7.07 |
| 44633.708333333336 | 6.41 |
| 44633.71875 | 6.54 |
| 44633.729166666664 | 6.74 |
| 44633.739583333336 | 4.98 |
| 44633.75 | 5.83 |
| 44633.760416666664 | 6.1 |
| 44633.770833333336 | 5.34 |
| 44633.78125 | 5.31 |
| 44633.791666666664 | 4.98 |
| 44633.802083333336 | 5.5 |
| 44633.8125 | 5.39 |
| 44633.822916666664 | 4.98 |
| 44633.833333333336 | 5.41 |
| 44633.84375 | 4.64 |
| 44633.854166666664 | 4.67 |
| 44633.864583333336 | 4.09 |
| 44633.875 | 3.93 |
| 44633.885416666664 | 3.94 |
| 44633.895833333336 | 4.45 |
| 44633.90625 | 4.93 |
| 44633.916666666664 | 4.57 |
| 44633.927083333336 | 5.25 |
| 44633.9375 | 5.62 |
| 44633.947916666664 | 5.22 |
| 44633.958333333336 | 5.26 |
| 44633.96875 | 5.13 |
| 44633.979166666664 | 5.9 |
| 44633.989583333336 | 5.23 |
| 44634.0 | 6.3 |
| 44634.010416666664 | 5.69 |
| 44634.020833333336 | 5.36 |
| 44634.03125 | 5.72 |
| 44634.041666666664 | 5.84 |
| 44634.052083333336 | 6.33 |
| 44634.0625 | 6.46 |
| 44634.072916666664 | 7.92 |
| 44634.083333333336 | 7.09 |
| 44634.09375 | 8.88 |
| 44634.104166666664 | 10.95 |
| 44634.114583333336 | 11.75 |
| 44634.125 | 11.04 |
| 44634.135416666664 | 13.88 |
| 44634.145833333336 | 10.27 |
| 44634.15625 | 10.23 |
| 44634.166666666664 | 11.91 |
| 44634.177083333336 | 12.17 |
| 44634.1875 | 8.94 |
| 44634.197916666664 | 10.31 |
| 44634.208333333336 | 10.55 |
| 44634.21875 | 10.45 |
| 44634.229166666664 | 9.13 |
| 44634.239583333336 | 8.77 |
| 44634.25 | 7.29 |
| 44634.260416666664 | 6.4 |
| 44634.270833333336 | 6.69 |
| 44634.28125 | 6.66 |
| 44634.291666666664 | 6.27 |
| 44634.302083333336 | 6.56 |
| 44634.3125 | 6.12 |
| 44634.322916666664 | 5.74 |
| 44634.333333333336 | 5.27 |
| 44634.34375 | 5.65 |
| 44634.354166666664 | 5.07 |
| 44634.364583333336 | 4.77 |
| 44634.375 | 5.95 |
| 44634.385416666664 | 5.27 |
| 44634.395833333336 | 5.3 |
| 44634.40625 | 5.13 |
| 44634.416666666664 | 5.8 |
| 44634.427083333336 | 5.35 |
| 44634.4375 | 5.46 |
| 44634.447916666664 | 5.51 |
| 44634.458333333336 | 4.67 |
| 44634.46875 | 5.24 |
| 44634.479166666664 | 5.14 |
| 44634.489583333336 | 4.48 |
| 44634.5 | 5.86 |
| 44634.510416666664 | 4.06 |
| 44634.520833333336 | 4.1 |
| 44634.53125 | 2.86 |
| 44634.541666666664 | 4.2 |
| 44634.552083333336 | 4.14 |
| 44634.5625 | 3.99 |
| 44634.572916666664 | 6.31 |
| 44634.583333333336 | 4.65 |
| 44634.59375 | 5.42 |
| 44634.604166666664 | 4.1 |
| 44634.614583333336 | 6.24 |
| 44634.625 | 5.88 |
| 44634.635416666664 | 7 |
| 44634.645833333336 | 6.02 |
| 44634.65625 | 6.77 |
| 44634.666666666664 | 6.31 |
| 44634.677083333336 | 6.59 |
| 44634.6875 | 6.09 |
| 44634.697916666664 | 5.5 |
| 44634.708333333336 | 6.17 |
| 44634.71875 | 4.86 |
| 44634.729166666664 | 6.29 |
| 44634.739583333336 | 5.73 |
| 44634.75 | 4.05 |
| 44634.760416666664 | 5.16 |
| 44634.770833333336 | 6.45 |
| 44634.78125 | 6.91 |
| 44634.791666666664 | 4.31 |
| 44634.802083333336 | 4.24 |
| 44634.8125 | 3.99 |
| 44634.822916666664 | 4.53 |
| 44634.833333333336 | 4.94 |
| 44634.84375 | 4.32 |
| 44634.854166666664 | 3.81 |
| 44634.864583333336 | 3.66 |
| 44634.875 | 3.26 |
| 44634.885416666664 | 4.2 |
| 44634.895833333336 | 4.04 |
| 44634.90625 | 3.4 |
| 44634.916666666664 | 3.67 |
| 44634.927083333336 | 4.28 |
| 44634.9375 | 3.83 |
| 44634.947916666664 | 3.35 |
| 44634.958333333336 | 3.91 |
| 44634.96875 | 3.64 |
| 44634.979166666664 | 4.03 |
| 44634.989583333336 | 3.85 |
| 44635.0 | 3.63 |
| 44635.010416666664 | 4.15 |
| 44635.020833333336 | 3.42 |
| 44635.03125 | 3.77 |
| 44635.041666666664 | 3.48 |
| 44635.052083333336 | 4.5 |
| 44635.0625 | 4.15 |
| 44635.072916666664 | 4.71 |
| 44635.083333333336 | 4.42 |
| 44635.09375 | 4.74 |
| 44635.104166666664 | 6.03 |
| 44635.114583333336 | 3.37 |
| 44635.125 | 6.81 |
| 44635.135416666664 | 10.87 |
| 44635.145833333336 | 4.57 |
| 44635.15625 | 4.75 |
| 44635.166666666664 | 10.94 |
| 44635.177083333336 | 16.56 |
| 44635.1875 | 7.76 |
| 44635.197916666664 | 6.98 |
| 44635.208333333336 | 6.92 |
| 44635.21875 | 6.97 |
| 44635.229166666664 | 5.44 |
| 44635.239583333336 | 5.6 |
| 44635.25 | 5.5 |
| 44635.260416666664 | 4.96 |
| 44635.270833333336 | 4.46 |
| 44635.28125 | 4.61 |
| 44635.291666666664 | 4.25 |
| 44635.302083333336 | 4.15 |
| 44635.3125 | 4.05 |
| 44635.322916666664 | 3.47 |
| 44635.333333333336 | 3.37 |
| 44635.34375 | 3.48 |
| 44635.354166666664 | 3.32 |
| 44635.364583333336 | 2.98 |
| 44635.375 | 2.94 |
| 44635.385416666664 | 3.14 |
| 44635.395833333336 | 3.14 |
| 44635.40625 | 2.52 |
| 44635.416666666664 | 2.82 |
| 44635.427083333336 | 3.48 |
| 44635.4375 | 2.93 |
| 44635.447916666664 | 3.32 |
| 44635.458333333336 | 3.67 |
| 44635.46875 | 3.89 |
| 44635.479166666664 | 4.73 |
| 44635.489583333336 | 4.62 |
| 44635.5 | 3.51 |
| 44635.510416666664 | 3.93 |
| 44635.520833333336 | 2.34 |
| 44635.53125 | 2.89 |
| 44635.541666666664 | 6.26 |
| 44635.552083333336 | 4.11 |
| 44635.5625 | 2.83 |
| 44635.572916666664 | 5.01 |
| 44635.583333333336 | 4.38 |
| 44635.59375 | 4.36 |
| 44635.604166666664 | 4.35 |
| 44635.614583333336 | 3.59 |
| 44635.625 | 3.47 |
| 44635.635416666664 | 4.63 |
| 44635.645833333336 | 4.35 |
| 44635.65625 | 4.33 |
| 44635.666666666664 | 5.81 |
| 44635.677083333336 | 5.24 |
| 44635.6875 | 5.86 |
| 44635.697916666664 | 4.95 |
| 44635.708333333336 | 4.1 |
| 44635.71875 | 4.99 |
| 44635.729166666664 | 4.44 |
| 44635.739583333336 | 4.24 |
| 44635.75 | 4.45 |
| 44635.760416666664 | 4.67 |
| 44635.770833333336 | 4.07 |
| 44635.78125 | 4.67 |
| 44635.791666666664 | 3.77 |
| 44635.802083333336 | 4.28 |
| 44635.8125 | 4.43 |
| 44635.822916666664 | 4.24 |
| 44635.833333333336 | 4.76 |
| 44635.84375 | 3.22 |
| 44635.854166666664 | 3.4 |
| 44635.864583333336 | 4.36 |
| 44635.875 | 4.33 |
| 44635.885416666664 | 3.81 |
| 44635.895833333336 | 5.05 |
| 44635.90625 | 3.84 |
| 44635.916666666664 | 4.14 |
| 44635.927083333336 | 3.77 |
| 44635.9375 | 3.79 |
| 44635.947916666664 | 3.52 |
| 44635.958333333336 | 3.73 |
| 44635.96875 | 3.51 |
| 44635.979166666664 | 3.56 |
| 44635.989583333336 | 4.1 |
| 44636.0 | 4.05 |
| 44636.010416666664 | 3.93 |
| 44636.020833333336 | 4.4 |
| 44636.03125 | 6.33 |
| 44636.041666666664 | 4.68 |
| 44636.052083333336 | 4.86 |
| 44636.0625 | 6.04 |
| 44636.072916666664 | 5.94 |
| 44636.083333333336 | 6.91 |
| 44636.09375 | 6.72 |
| 44636.104166666664 | 5.56 |
| 44636.114583333336 | 5.41 |
| 44636.125 | 4.84 |
| 44636.135416666664 | 5.13 |
| 44636.145833333336 | 5.8 |
| 44636.15625 | 5.72 |
| 44636.166666666664 | 6.11 |
| 44636.177083333336 | 5.89 |
| 44636.1875 | 6.58 |
| 44636.197916666664 | 7.83 |
| 44636.208333333336 | 5.17 |
| 44636.21875 | 5.87 |
| 44636.229166666664 | 11.13 |
| 44636.239583333336 | 13.35 |
| 44636.25 | 7.62 |
| 44636.260416666664 | 7.5 |
| 44636.270833333336 | 6.51 |
| 44636.28125 | 6.13 |
| 44636.291666666664 | 6.69 |
| 44636.302083333336 | 6.05 |
| 44636.3125 | 5.51 |
| 44636.322916666664 | 5.95 |
| 44636.333333333336 | 4.94 |
| 44636.34375 | 4.72 |
| 44636.354166666664 | 4.81 |
| 44636.364583333336 | 4.74 |
| 44636.375 | 3.99 |
| 44636.385416666664 | 3.99 |
| 44636.395833333336 | 5.13 |
| 44636.40625 | 3.84 |
| 44636.416666666664 | 3.85 |
| 44636.427083333336 | 4.06 |
| 44636.4375 | 4.71 |
| 44636.447916666664 | 3.38 |
| 44636.458333333336 | 3.61 |
| 44636.46875 | 4.89 |
| 44636.479166666664 | 3.89 |
| 44636.489583333336 | 3.92 |
| 44636.5 | 3.57 |
| 44636.510416666664 | 3.91 |
| 44636.520833333336 | 3.28 |
| 44636.53125 | 4.96 |
| 44636.541666666664 | 3.75 |
| 44636.552083333336 | 3.68 |
| 44636.5625 | 10.51 |
| 44636.572916666664 | 8.31 |
| 44636.583333333336 | 1.56 |
| 44636.59375 | 6.27 |
| 44636.604166666664 | 26.06 |
| 44636.614583333336 | 6.62 |
| 44636.625 | 6.76 |
| 44636.635416666664 | 4.53 |
| 44636.645833333336 | 6.21 |
| 44636.65625 | 5.74 |
| 44636.666666666664 | 5.78 |
| 44636.677083333336 | 5.44 |
| 44636.6875 | 6.29 |
| 44636.697916666664 | 6.11 |
| 44636.708333333336 | 5.77 |
| 44636.71875 | 2.51 |
| 44636.729166666664 | 11.31 |
| 44636.739583333336 | 4.52 |
| 44636.75 | 7.58 |
| 44636.760416666664 | 30.9 |
| 44636.770833333336 | 7.54 |
| 44636.78125 | 7.09 |
| 44636.791666666664 | 6.71 |
| 44636.802083333336 | 5.77 |
| 44636.8125 | 5.94 |
| 44636.822916666664 | 6.2 |
| 44636.833333333336 | 10.12 |
| 44636.84375 | 3.69 |
| 44636.854166666664 | 6.44 |
| 44636.864583333336 | 5.55 |
| 44636.875 | 6.56 |
| 44636.885416666664 | 6.17 |
| 44636.895833333336 | 5.73 |
| 44636.90625 | 5.36 |
| 44636.916666666664 | 4.92 |
| 44636.927083333336 | 4.61 |
| 44636.9375 | 5.39 |
| 44636.947916666664 | 3.77 |
| 44636.958333333336 | 3.45 |
| 44636.96875 | 3.79 |
| 44636.979166666664 | 4.26 |
| 44636.989583333336 | 4.53 |
| 44637.0 | 4.57 |
| 44637.010416666664 | 4.25 |
| 44637.020833333336 | 4.07 |
| 44637.03125 | 4.47 |
| 44637.041666666664 | 5.17 |
| 44637.052083333336 | 4.4 |
| 44637.0625 | 4.6 |
| 44637.072916666664 | 4.62 |
| 44637.083333333336 | 5.89 |
| 44637.09375 | 6.94 |
| 44637.104166666664 | 6.48 |
| 44637.114583333336 | 5.9 |
| 44637.125 | 5.34 |
| 44637.135416666664 | 4.86 |
| 44637.145833333336 | 5.35 |
| 44637.15625 | 6.51 |
| 44637.166666666664 | 6.59 |
| 44637.177083333336 | 6.48 |
| 44637.1875 | 6.56 |
| 44637.197916666664 | 6.71 |
| 44637.208333333336 | 6.92 |
| 44637.21875 | 6.42 |
| 44637.229166666664 | 7.44 |
| 44637.239583333336 | 6.84 |
| 44637.25 | 7.77 |
| 44637.260416666664 | 11.77 |
| 44637.270833333336 | 9.75 |
| 44637.28125 | 10.84 |
| 44637.291666666664 | 6.37 |
| 44637.302083333336 | 7.25 |
| 44637.3125 | 6.67 |
| 44637.322916666664 | 9.03 |
| 44637.333333333336 | 5.99 |
| 44637.34375 | 6.75 |
| 44637.354166666664 | 6.81 |
| 44637.364583333336 | 5.16 |
| 44637.375 | 4.27 |
| 44637.385416666664 | 4.9 |
| 44637.395833333336 | 5.07 |
| 44637.40625 | 4.65 |
| 44637.416666666664 | 4.82 |
| 44637.427083333336 | 4.58 |
| 44637.4375 | 6.3 |
| 44637.447916666664 | 4.62 |
| 44637.458333333336 | 4.55 |
| 44637.46875 | 5.16 |
| 44637.479166666664 | 4.56 |
| 44637.489583333336 | 5.21 |
| 44637.5 | 6.21 |
| 44637.510416666664 | 7.69 |
| 44637.520833333336 | 5.11 |
| 44637.53125 | 2.98 |
| 44637.541666666664 | 6.33 |
| 44637.552083333336 | 4.76 |
| 44637.5625 | 1.79 |
| 44637.572916666664 | 5.64 |
| 44637.583333333336 | 6.24 |
| 44637.59375 | 6.26 |
| 44637.604166666664 | 7.57 |
| 44637.614583333336 | 18.03 |
| 44637.625 | 34.55 |
| 44637.635416666664 | 6.72 |
| 44637.645833333336 | 2.1 |
| 44637.65625 | 5.55 |
| 44637.666666666664 | 6.55 |
| 44637.677083333336 | 5.2 |
| 44637.6875 | 2.95 |
| 44637.697916666664 | 17.32 |
| 44637.708333333336 | 5.86 |
| 44637.71875 | 7.42 |
| 44637.729166666664 | 10.46 |
| 44637.739583333336 | 6.87 |
| 44637.75 | 8.68 |
| 44637.760416666664 | 8.85 |
| 44637.770833333336 | 11.48 |
| 44637.78125 | 13.1 |
| 44637.791666666664 | 17.48 |
| 44637.802083333336 | 21.63 |
| 44637.8125 | 27.33 |
| 44637.822916666664 | 44.43 |
| 44637.833333333336 | 7.07 |
| 44637.84375 | 10.5 |
| 44637.854166666664 | 6.57 |
| 44637.864583333336 | 5.85 |
| 44637.875 | 41.21 |
| 44637.885416666664 | 17.33 |
| 44637.895833333336 | 6.22 |
| 44637.90625 | 5.76 |
| 44637.916666666664 | 7.11 |
| 44637.927083333336 | 5.02 |
| 44637.9375 | 2.66 |
| 44637.947916666664 | 2.71 |
| 44637.958333333336 | 470.77 |
| 44637.96875 | 5.73 |
| 44637.979166666664 | 5.5 |
| 44637.989583333336 | 4.38 |
| 44638.0 | 4.4 |
| 44638.010416666664 | 7.79 |
| 44638.020833333336 | 4.39 |
| 44638.03125 | 4.91 |
| 44638.041666666664 | 4.85 |
| 44638.052083333336 | 7.07 |
| 44638.0625 | 12.92 |
| 44638.072916666664 | 16 |
| 44638.083333333336 | 34.27 |
| 44638.09375 | 8.31 |
| 44638.104166666664 | 147.4 |
| 44638.114583333336 | 18.35 |
| 44638.125 | 33.99 |
| 44638.135416666664 | 9.08 |
| 44638.145833333336 | 62.86 |
| 44638.15625 | 51.43 |
| 44638.166666666664 | 33.54 |
| 44638.177083333336 | 4.41 |
| 44638.1875 | 51.2 |
| 44638.197916666664 | 25.73 |
| 44638.208333333336 | 11.05 |
| 44638.21875 | 12.06 |
| 44638.229166666664 | 12.57 |
| 44638.239583333336 | 17.89 |
| 44638.25 | 26.44 |
| 44638.260416666664 | 11.8 |
| 44638.270833333336 | 29.5 |
| 44638.28125 | 51.71 |
| 44638.291666666664 | 21.27 |
| 44638.302083333336 | 10.89 |
| 44638.3125 | 10.55 |
| 44638.322916666664 | 11.72 |
| 44638.333333333336 | 9.06 |
| 44638.34375 | 7.39 |
| 44638.354166666664 | 7.39 |
| 44638.364583333336 | 7.69 |
| 44638.375 | 9.04 |
| 44638.385416666664 | 35.03 |
| 44638.395833333336 | 6.72 |
| 44638.40625 | 6.53 |
| 44638.416666666664 | 3.99 |
| 44638.427083333336 | 6.35 |
| 44638.4375 | 5.75 |
| 44638.447916666664 | 6.58 |
| 44638.458333333336 | 19.81 |
| 44638.46875 | 6.69 |
| 44638.479166666664 | 5.03 |
| 44638.489583333336 | 6.32 |
| 44638.5 | 6.38 |
| 44638.510416666664 | 4.41 |
| 44638.520833333336 | 4.7 |
| 44638.53125 | 5.17 |
| 44638.541666666664 | 5.28 |
| 44638.552083333336 | 4.9 |
| 44638.5625 | 4.15 |
| 44638.572916666664 | 5.09 |
| 44638.583333333336 | 4.64 |
| 44638.59375 | 16.17 |
| 44638.604166666664 | 3.48 |
| 44638.614583333336 | 47.01 |
| 44638.625 | 28.62 |
| 44638.635416666664 | 21.4 |
| 44638.645833333336 | 27.21 |
| 44638.65625 | 6.89 |
| 44638.666666666664 | 36.49 |
| 44638.677083333336 | 3.19 |
| 44638.6875 | 19.58 |
| 44638.697916666664 | 3.95 |
| 44638.708333333336 | 35.26 |
| 44638.71875 | 42.18 |
| 44638.729166666664 | 32.09 |
| 44638.739583333336 | 3.54 |
| 44638.75 | 11.8 |
| 44638.760416666664 | 9.28 |
| 44638.770833333336 | 6.03 |
| 44638.78125 | 38.96 |
| 44638.791666666664 | 41.75 |
| 44638.802083333336 | 37.97 |
| 44638.8125 | 8.5 |
| 44638.822916666664 | 21.78 |
| 44638.833333333336 | 60.4 |
| 44638.84375 | 31.06 |
| 44638.854166666664 | 11.28 |
| 44638.864583333336 | 39.19 |
| 44638.875 | 10.93 |
| 44638.885416666664 | 7.96 |
| 44638.895833333336 | 7.51 |
| 44638.90625 | 9.02 |
| 44638.916666666664 | 6.16 |
| 44638.927083333336 | 9.81 |
| 44638.9375 | 38.4 |
| 44638.947916666664 | 8.96 |
| 44638.958333333336 | 8.3 |
| 44638.96875 | 8.19 |
| 44638.979166666664 | 1.73 |
| 44638.989583333336 | 3.18 |
| 44639.0 | 4.91 |
| 44639.010416666664 | 5.22 |
| 44639.020833333336 | 5.34 |
| 44639.03125 | 5.7 |
| 44639.041666666664 | 4.48 |
| 44639.052083333336 | 4.75 |
| 44639.0625 | 4.16 |
| 44639.072916666664 | 17.3 |
| 44639.083333333336 | 3.04 |
| 44639.09375 | 163.99 |
| 44639.104166666664 | 5.13 |
| 44639.114583333336 | 19.51 |
| 44639.125 | 6.14 |
| 44639.135416666664 | 6.1 |
| 44639.145833333336 | 15.08 |
| 44639.15625 | 2.5 |
| 44639.166666666664 | 3.6 |
| 44639.177083333336 | 17.96 |
| 44639.1875 | 8.42 |
| 44639.197916666664 | 27.09 |
| 44639.208333333336 | 117.66 |
| 44639.21875 | 326.74 |
| 44639.229166666664 | 12.7 |
| 44639.239583333336 | 25.5 |
| 44639.25 | 19.93 |
| 44639.260416666664 | 43.22 |
| 44639.270833333336 | 15.19 |
| 44639.28125 | 8.68 |
| 44639.291666666664 | 18.28 |
| 44639.302083333336 | 17.74 |
| 44639.3125 | 33.37 |
| 44639.322916666664 | 10.35 |
| 44639.333333333336 | 35.05 |
| 44639.34375 | 9.19 |
| 44639.354166666664 | 15.18 |
| 44639.364583333336 | 9.25 |
| 44639.375 | 505.96 |
| 44639.385416666664 | 511.47 |
| 44639.395833333336 | 11.15 |
| 44639.40625 | 8.26 |
| 44639.416666666664 | 13.43 |
| 44639.427083333336 | 7.82 |
| 44639.4375 | 6.58 |
| 44639.447916666664 | 6.9 |
| 44639.458333333336 | 6.56 |
| 44639.46875 | 6.41 |
| 44639.479166666664 | 7.09 |
| 44639.489583333336 | 5.56 |
| 44639.5 | 5.66 |
| 44639.510416666664 | 4.91 |
| 44639.520833333336 | 2.88 |
| 44639.53125 | 5.2 |
| 44639.541666666664 | 9.15 |
| 44639.552083333336 | 5.95 |
| 44639.5625 | 14.5 |
| 44639.572916666664 | 17.37 |
| 44639.583333333336 | 13.02 |
| 44639.59375 | 10.68 |
| 44639.604166666664 | 98.16 |
| 44639.614583333336 | 28.57 |
| 44639.625 | 9.03 |
| 44639.635416666664 | 2.7 |
| 44639.645833333336 | 3.6 |
| 44639.65625 | 2.99 |
| 44639.666666666664 | 47.59 |
| 44639.677083333336 | 29.6 |
| 44639.6875 | 58.39 |
| 44639.697916666664 | 3.97 |
| 44639.708333333336 | 19.64 |
| 44639.71875 | 189.46 |
| 44639.729166666664 | 21.48 |
| 44639.739583333336 | 43.49 |
| 44639.75 | 41.46 |
| 44639.760416666664 | 153.91 |
| 44639.770833333336 | 13.11 |
| 44639.78125 | 61.67 |
| 44639.791666666664 | 52.21 |
| 44639.802083333336 | 72.55 |
| 44639.8125 | 243.34 |
| 44639.822916666664 | 12.64 |
| 44639.833333333336 | 55.07 |
| 44639.84375 | 10.16 |
| 44639.854166666664 | 22.16 |
| 44639.864583333336 | 17.52 |
| 44639.875 | 13.53 |
| 44639.885416666664 | 189.24 |
| 44639.895833333336 | 23.73 |
| 44639.90625 | 31.69 |
| 44639.916666666664 | 27.48 |
| 44639.927083333336 | 16.4 |
| 44639.9375 | 6.93 |
| 44639.947916666664 | 5.61 |
| 44639.958333333336 | 46.6 |
| 44639.96875 | 8.34 |
| 44639.979166666664 | 10.83 |
| 44639.989583333336 | 5.13 |
| 44640.0 | 12.54 |
| 44640.010416666664 | 5.46 |
| 44640.020833333336 | 6.86 |
| 44640.03125 | 6.31 |
| 44640.041666666664 | 40.84 |
| 44640.052083333336 | 7.39 |
| 44640.0625 | 18.87 |
| 44640.072916666664 | 6.1 |
| 44640.083333333336 | 37.72 |
| 44640.09375 | 48.86 |
| 44640.104166666664 | 6.6 |
| 44640.114583333336 | 34.37 |
| 44640.125 | 9.71 |
| 44640.135416666664 | 4.65 |
| 44640.145833333336 | 14.34 |
| 44640.15625 | 21.25 |
| 44640.166666666664 | 4.43 |
| 44640.177083333336 | 45.61 |
| 44640.1875 | 22.56 |
| 44640.197916666664 | 3.41 |
| 44640.208333333336 | 49.43 |
| 44640.21875 | 17.77 |
| 44640.229166666664 | 32.51 |
| 44640.239583333336 | 115.5 |
| 44640.25 | 29.83 |
| 44640.260416666664 | 45.75 |
| 44640.270833333336 | 12.01 |
| 44640.28125 | 260.1 |
| 44640.291666666664 | 78.03 |
| 44640.302083333336 | 45.07 |
| 44640.3125 | 27.86 |
| 44640.322916666664 | 22.81 |
| 44640.333333333336 | 51.48 |
| 44640.34375 | 15.61 |
| 44640.354166666664 | 113.65 |
| 44640.364583333336 | 15.05 |
| 44640.375 | 12.95 |
| 44640.385416666664 | 10.81 |
| 44640.395833333336 | 8.11 |
| 44640.40625 | 11.29 |
| 44640.416666666664 | 11.29 |
| 44640.427083333336 | 11.41 |
| 44640.4375 | 10.09 |
| 44640.447916666664 | 9.03 |
| 44640.458333333336 | 7.79 |
| 44640.46875 | 10.53 |
| 44640.479166666664 | 7.15 |
| 44640.489583333336 | 15.8 |
| 44640.5 | 116.81 |
| 44640.510416666664 | 4.08 |
| 44640.520833333336 | 8.51 |
| 44640.53125 | 6.75 |
| 44640.541666666664 | 5.01 |
| 44640.552083333336 | 7.46 |
| 44640.5625 | 5.99 |
| 44640.572916666664 | 15.69 |
| 44640.583333333336 | 6.54 |
| 44640.59375 | 5.69 |
| 44640.604166666664 | 5.87 |
| 44640.614583333336 | 391.03 |
| 44640.625 | 3.99 |
| 44640.635416666664 | 24.16 |
| 44640.645833333336 | 12.17 |
| 44640.65625 | 44.3 |
| 44640.666666666664 | 8.82 |
| 44640.677083333336 | 208.04 |
| 44640.6875 | 19.96 |
| 44640.697916666664 | 4.33 |
| 44640.708333333336 | 80.22 |
| 44640.71875 | 9.8 |
| 44640.729166666664 | 29.54 |
| 44640.739583333336 | 56.5 |
| 44640.75 | 72.02 |
| 44640.760416666664 | 424.46 |
| 44640.770833333336 | 13.01 |
| 44640.78125 | 52.98 |
| 44640.791666666664 | 290.29 |
| 44640.802083333336 | 436.95 |
| 44640.8125 | 19.67 |
| 44640.822916666664 | 18.67 |
| 44640.833333333336 | 23.49 |
| 44640.84375 | 78.54 |
| 44640.854166666664 | 13.34 |
| 44640.864583333336 | 106.83 |
| 44640.875 | 12.29 |
| 44640.885416666664 | 35.45 |
| 44640.895833333336 | 12.14 |
| 44640.90625 | 11.57 |
| 44640.916666666664 | 9.33 |
| 44640.927083333336 | 9.57 |
| 44640.9375 | 50.22 |
| 44640.947916666664 | 38.29 |
| 44640.958333333336 | 18.2 |
| 44640.96875 | 7.27 |
| 44640.979166666664 | 34.42 |
| 44640.989583333336 | 6.78 |
| 44641.0 | 6.1 |
| 44641.010416666664 | 6.21 |
| 44641.020833333336 | 3.91 |
| 44641.03125 | 5.66 |
| 44641.041666666664 | 5.82 |
| 44641.052083333336 | 8.39 |
| 44641.0625 | 50.05 |
| 44641.072916666664 | 6.04 |
| 44641.083333333336 | 31.87 |
| 44641.09375 | 9.09 |
| 44641.104166666664 | 34.06 |
| 44641.114583333336 | 6.4 |
| 44641.125 | 6.27 |
| 44641.135416666664 | 5.98 |
| 44641.145833333336 | 4.83 |
| 44641.15625 | 9.75 |
| 44641.166666666664 | 10.46 |
| 44641.177083333336 | 5.89 |
| 44641.1875 | 104.9 |
| 44641.197916666664 | 30.21 |
| 44641.208333333336 | 24.86 |
| 44641.21875 | 514.48 |
| 44641.229166666664 | 7.83 |
| 44641.239583333336 | 14.71 |
| 44641.25 | 110.48 |
| 44641.260416666664 | 7.23 |
| 44641.270833333336 | 5.72 |
| 44641.28125 | 16.03 |
| 44641.291666666664 | 92.08 |
| 44641.302083333336 | 283.7 |
| 44641.3125 | 154.98 |
| 44641.322916666664 | 53.46 |
| 44641.333333333336 | 49.69 |
| 44641.34375 | 119.42 |
| 44641.354166666664 | 88.77 |
| 44641.364583333336 | 16.88 |
| 44641.375 | 10.71 |
| 44641.385416666664 | 9.16 |
| 44641.395833333336 | 13.41 |
| 44641.40625 | 15.19 |
| 44641.416666666664 | 6.55 |
| 44641.427083333336 | 45.24 |
| 44641.4375 | 9.4 |
| 44641.447916666664 | 7.8 |
| 44641.458333333336 | 8.41 |
| 44641.46875 | 13.6 |
| 44641.479166666664 | 19.89 |
| 44641.489583333336 | 6.93 |
| 44641.5 | 278.34 |
| 44641.510416666664 | 7.05 |
| 44641.520833333336 | 4.95 |
| 44641.53125 | 13.71 |
| 44641.541666666664 | 23 |
| 44641.552083333336 | 20.27 |
| 44641.5625 | 104.55 |
| 44641.572916666664 | 4.71 |
| 44641.583333333336 | 5.43 |
| 44641.59375 | 5.82 |
| 44641.604166666664 | 17.82 |
| 44641.614583333336 | 4.6 |
| 44641.625 | 6.99 |
| 44641.635416666664 | 4.82 |
| 44641.645833333336 | 6.1 |
| 44641.65625 | 44.13 |
| 44641.666666666664 | 60.36 |
| 44641.677083333336 | 6.51 |
| 44641.6875 | 21.27 |
| 44641.697916666664 | 80.89 |
| 44641.708333333336 | 7.27 |
| 44641.71875 | 348.3 |
| 44641.729166666664 | 207.16 |
| 44641.739583333336 | 17.76 |
| 44641.75 | 69.32 |
| 44641.760416666664 | 258.17 |
| 44641.770833333336 | 14.18 |
| 44641.78125 | 70.39 |
| 44641.791666666664 | 136.53 |
| 44641.802083333336 | 6.24 |
| 44641.8125 | 154.91 |
| 44641.822916666664 | 94.96 |
| 44641.833333333336 | 7.71 |
| 44641.84375 | 88.8 |
| 44641.854166666664 | 355.02 |
| 44641.864583333336 | 89.56 |
| 44641.875 | 180.56 |
| 44641.885416666664 | 27.99 |
| 44641.895833333336 | 7.05 |
| 44641.90625 | 11.3 |
| 44641.916666666664 | 14.67 |
| 44641.927083333336 | 11.2 |
| 44641.9375 | 4.03 |
| 44641.947916666664 | 39.18 |
| 44641.958333333336 | 13.96 |
| 44641.96875 | 7.18 |
| 44641.979166666664 | 4.49 |
| 44641.989583333336 | 25.19 |
| 44642.0 | 26.5 |
| 44642.010416666664 | 6.65 |
| 44642.020833333336 | 11.51 |
| 44642.03125 | 6.13 |
| 44642.041666666664 | 10.17 |
| 44642.052083333336 | 8.76 |
| 44642.0625 | 4.21 |
| 44642.072916666664 | 26.44 |
| 44642.083333333336 | 3.3 |
| 44642.09375 | 5.92 |
| 44642.104166666664 | 6.89 |
| 44642.114583333336 | 4.51 |
| 44642.125 | 6.64 |
| 44642.135416666664 | 7.04 |
| 44642.145833333336 | 5.9 |
| 44642.15625 | 5.07 |
| 44642.166666666664 | 7.28 |
| 44642.177083333336 | 5.83 |
| 44642.1875 | 18.49 |
| 44642.197916666664 | 5.57 |
| 44642.208333333336 | 6.23 |
| 44642.21875 | 42.6 |
| 44642.229166666664 | 8.08 |
| 44642.239583333336 | 65.37 |
| 44642.25 | 8.67 |
| 44642.260416666664 | 85.72 |
| 44642.270833333336 | 10.19 |
| 44642.28125 | 70.91 |
| 44642.291666666664 | 14.19 |
| 44642.302083333336 | 109.24 |
| 44642.3125 | 46.4 |
| 44642.322916666664 | 243.98 |
| 44642.333333333336 | 77.72 |
| 44642.34375 | 180.06 |
| 44642.354166666664 | 222.32 |
| 44642.364583333336 | 33.74 |
| 44642.375 | 203.62 |
| 44642.385416666664 | 38.65 |
| 44642.395833333336 | 146.79 |
| 44642.40625 | 172.95 |
| 44642.416666666664 | 511.5 |
| 44642.427083333336 | 74.55 |
| 44642.4375 | 53.3 |
| 44642.447916666664 | 30.86 |
| 44642.458333333336 | 8.04 |
| 44642.46875 | 9.09 |
| 44642.479166666664 | 139.66 |
| 44642.489583333336 | 39.9 |
| 44642.5 | 22.35 |
| 44642.510416666664 | 17.4 |
| 44642.520833333336 | 8.05 |
| 44642.53125 | 13.77 |
| 44642.541666666664 | 7.12 |
| 44642.552083333336 | 10.63 |
| 44642.5625 | 5.86 |
| 44642.572916666664 | 5.96 |
| 44642.583333333336 | 6.27 |
| 44642.59375 | 25.82 |
| 44642.604166666664 | 8.75 |
| 44642.614583333336 | 5.26 |
| 44642.625 | 8.88 |
| 44642.635416666664 | 11.06 |
| 44642.645833333336 | 166.96 |
| 44642.65625 | 20.32 |
| 44642.666666666664 | 28.47 |
| 44642.677083333336 | 21.2 |
| 44642.6875 | 73.7 |
| 44642.697916666664 | 28.55 |
| 44642.708333333336 | 80.89 |
| 44642.71875 | 210.5 |
| 44642.729166666664 | 312.53 |
| 44642.739583333336 | 41 |
| 44642.75 | 17.74 |
| 44642.760416666664 | 7.26 |
| 44642.770833333336 | 31.56 |
| 44642.78125 | 29.8 |
| 44642.791666666664 | 113.66 |
| 44642.802083333336 | 12.25 |
| 44642.8125 | 350.81 |
| 44642.822916666664 | 285.81 |
| 44642.833333333336 | 74.68 |
| 44642.84375 | 79.63 |
| 44642.854166666664 | 75.87 |
| 44642.864583333336 | 18.27 |
| 44642.875 | 227.32 |
| 44642.885416666664 | 104.96 |
| 44642.895833333336 | 33.24 |
| 44642.90625 | 71.04 |
| 44642.916666666664 | 181.9 |
| 44642.927083333336 | 18.96 |
| 44642.9375 | 50.49 |
| 44642.947916666664 | 69.47 |
| 44642.958333333336 | 46.53 |
| 44642.96875 | 8.08 |
| 44642.979166666664 | 52.84 |
| 44642.989583333336 | 17 |
| 44643.0 | 9.54 |
| 44643.010416666664 | 53.33 |
| 44643.020833333336 | 10.67 |
| 44643.03125 | 7.18 |
| 44643.041666666664 | 6.22 |
| 44643.052083333336 | 4.94 |
| 44643.0625 | 5.44 |
| 44643.072916666664 | 32.91 |
| 44643.083333333336 | 5.83 |
| 44643.09375 | 5.84 |
| 44643.104166666664 | 1.6 |
| 44643.114583333336 | 3.78 |
| 44643.125 | 7.48 |
| 44643.135416666664 | 94.95 |
| 44643.145833333336 | 5.08 |
| 44643.15625 | 55.5 |
| 44643.166666666664 | 7.57 |
| 44643.177083333336 | 4.63 |
| 44643.1875 | 6.57 |
| 44643.197916666664 | 20.85 |
| 44643.208333333336 | 7.56 |
| 44643.21875 | 37.81 |
| 44643.229166666664 | 43.98 |
| 44643.239583333336 | 77.18 |
| 44643.25 | 8.19 |
| 44643.260416666664 | 7.88 |
| 44643.270833333336 | 303.74 |
| 44643.28125 | 14.72 |
| 44643.291666666664 | 57.57 |
| 44643.302083333336 | 8.24 |
| 44643.3125 | 451.64 |
| 44643.322916666664 | 15.36 |
| 44643.333333333336 | 6.44 |
| 44643.34375 | 10.14 |
| 44643.354166666664 | 53.18 |
| 44643.364583333336 | 460.1 |
| 44643.375 | 153.22 |
| 44643.385416666664 | 80.11 |
| 44643.395833333336 | 61.8 |
| 44643.40625 | 105.15 |
| 44643.416666666664 | 255.85 |
| 44643.427083333336 | 50.3 |
| 44643.4375 | 25 |
| 44643.447916666664 | 126.77 |
| 44643.458333333336 | 155.04 |
| 44643.46875 | 169.27 |
| 44643.479166666664 | 10.36 |
| 44643.489583333336 | 17.92 |
| 44643.5 | 70 |
| 44643.510416666664 | 25.25 |
| 44643.520833333336 | 8.19 |
| 44643.53125 | 7.1 |
| 44643.541666666664 | 16.61 |
| 44643.552083333336 | 382.59 |
| 44643.5625 | 70.95 |
| 44643.572916666664 | 16.54 |
| 44643.583333333336 | 61.5 |
| 44643.59375 | 18.57 |
| 44643.604166666664 | 53.85 |
| 44643.614583333336 | 6.58 |
| 44643.625 | 14.49 |
| 44643.635416666664 | 134.41 |
| 44643.645833333336 | 9.06 |
| 44643.65625 | 63.81 |
| 44643.666666666664 | 13.79 |
| 44643.677083333336 | 43.94 |
| 44643.6875 | 28.56 |
| 44643.697916666664 | 65.78 |
| 44643.708333333336 | 197.84 |
| 44643.71875 | 51.86 |
| 44643.729166666664 | 129.75 |
| 44643.739583333336 | 254.04 |
| 44643.75 | 6.88 |
| 44643.760416666664 | 164.61 |
| 44643.770833333336 | 49.19 |
| 44643.78125 | 57.75 |
| 44643.791666666664 | 108.33 |
| 44643.802083333336 | 140.18 |
| 44643.8125 | 101.35 |
| 44643.822916666664 | 42.18 |
| 44643.833333333336 | 119.62 |
| 44643.84375 | 190.31 |
| 44643.854166666664 | 394.96 |
| 44643.864583333336 | 76.21 |
| 44643.875 | 52.19 |
| 44643.885416666664 | 112.73 |
| 44643.895833333336 | 8.46 |
| 44643.90625 | 356.6 |
| 44643.916666666664 | 64.02 |
| 44643.927083333336 | 11.37 |
| 44643.9375 | 197.24 |
| 44643.947916666664 | 52.12 |
| 44643.958333333336 | 67.81 |
| 44643.96875 | 161.09 |
| 44643.979166666664 | 32.74 |
| 44643.989583333336 | 155.69 |
| 44644.0 | 6.48 |
| 44644.010416666664 | 97.87 |
| 44644.020833333336 | 113.5 |
| 44644.03125 | 184.62 |
| 44644.041666666664 | 16.41 |
| 44644.052083333336 | 19.52 |
| 44644.0625 | 49.66 |
| 44644.072916666664 | 6.13 |
| 44644.083333333336 | 8.67 |
| 44644.09375 | 23 |
| 44644.104166666664 | 202.08 |
| 44644.114583333336 | 77.4 |
| 44644.125 | 511.7 |
| 44644.135416666664 | 9.06 |
| 44644.145833333336 | 11.51 |
| 44644.15625 | 48.47 |
| 44644.166666666664 | 31.26 |
| 44644.177083333336 | 47.4 |
| 44644.1875 | 95.16 |
| 44644.197916666664 | 22.97 |
| 44644.208333333336 | 32.68 |
| 44644.21875 | 118.54 |
| 44644.229166666664 | 142.37 |
| 44644.239583333336 | 16.03 |
| 44644.25 | 69.46 |
| 44644.260416666664 | 262.66 |
| 44644.270833333336 | 105.41 |
| 44644.28125 | 228.22 |
| 44644.291666666664 | 4.68 |
| 44644.302083333336 | 6.49 |
| 44644.3125 | 251.39 |
| 44644.322916666664 | 46.13 |
| 44644.333333333336 | 29.84 |
| 44644.34375 | 167.1 |
| 44644.354166666664 | 61.33 |
| 44644.364583333336 | 5.06 |
| 44644.375 | 6.8 |
| 44644.385416666664 | 6.85 |
| 44644.395833333336 | 97.17 |
| 44644.40625 | 99.4 |
| 44644.416666666664 | 80.11 |
| 44644.427083333336 | 161.17 |
| 44644.4375 | 41.28 |
| 44644.447916666664 | 304.93 |
| 44644.458333333336 | 310.53 |
| 44644.46875 | 9.46 |
| 44644.479166666664 | 225.4 |
| 44644.489583333336 | 185.4 |
| 44644.5 | 67.55 |
| 44644.510416666664 | 174.15 |
| 44644.520833333336 | 106.07 |
| 44644.53125 | 21.03 |
| 44644.541666666664 | 55.48 |
| 44644.552083333336 | 214.62 |
| 44644.5625 | 17.92 |
| 44644.572916666664 | 15.39 |
| 44644.583333333336 | 14.04 |
| 44644.59375 | 14.09 |
| 44644.604166666664 | 11.36 |
| 44644.614583333336 | 15.52 |
| 44644.625 | 12.71 |
| 44644.635416666664 | 306.18 |
| 44644.645833333336 | 11.32 |
| 44644.65625 | 9.03 |
| 44644.666666666664 | 10.22 |
| 44644.677083333336 | 75.98 |
| 44644.6875 | 13.1 |
| 44644.697916666664 | 7.77 |
| 44644.708333333336 | 5.23 |
| 44644.71875 | 11.85 |
| 44644.729166666664 | 4.92 |
| 44644.739583333336 | 4.37 |
| 44644.75 | 8.99 |
| 44644.760416666664 | 4.05 |
| 44644.770833333336 | 7.42 |
| 44644.78125 | 69.48 |
| 44644.791666666664 | 6.34 |
| 44644.802083333336 | 28.44 |
| 44644.8125 | 10.49 |
| 44644.822916666664 | 514.29 |
| 44644.833333333336 | 8.07 |
| 44644.84375 | 117.57 |
| 44644.854166666664 | 506.93 |
| 44644.864583333336 | 120.69 |
| 44644.875 | 23.56 |
| 44644.885416666664 | 86.3 |
| 44644.895833333336 | 136.74 |
| 44644.90625 | 93.74 |
| 44644.916666666664 | 74.17 |
| 44644.927083333336 | 12.58 |
| 44644.9375 | 14.29 |
| 44644.947916666664 | 38.22 |
| 44644.958333333336 | 14.86 |
| 44644.96875 | 13.98 |
| 44644.979166666664 | 19.61 |
| 44644.989583333336 | 16.35 |
| 44645.0 | 14.63 |
| 44645.010416666664 | 15.19 |
| 44645.020833333336 | 24.43 |
| 44645.03125 | 33.57 |
| 44645.041666666664 | 34.53 |
| 44645.052083333336 | 197.52 |
| 44645.0625 | 16.91 |
| 44645.072916666664 | 99.15 |
| 44645.083333333336 | 13.67 |
| 44645.09375 | 23.89 |
| 44645.104166666664 | 11.34 |
| 44645.114583333336 | 7.53 |
| 44645.125 | 10.28 |
| 44645.135416666664 | 26.26 |
| 44645.145833333336 | 10.78 |
| 44645.15625 | 7.24 |
| 44645.166666666664 | 6.17 |
| 44645.177083333336 | 6.68 |
| 44645.1875 | 5.96 |
| 44645.197916666664 | 8.34 |
| 44645.208333333336 | 3.29 |
| 44645.21875 | 15.27 |
| 44645.229166666664 | 4.92 |
| 44645.239583333336 | 14.22 |
| 44645.25 | 10.64 |
| 44645.260416666664 | 5.14 |
| 44645.270833333336 | 34.99 |
| 44645.28125 | 6.14 |
| 44645.291666666664 | 7.03 |
| 44645.302083333336 | 9.57 |
| 44645.3125 | 9.01 |
| 44645.322916666664 | 65.23 |
| 44645.333333333336 | 4.54 |
| 44645.34375 | 35.04 |
| 44645.354166666664 | 6.26 |
| 44645.364583333336 | 284.46 |
| 44645.375 | 8.36 |
| 44645.385416666664 | 7.07 |
| 44645.395833333336 | 399.55 |
| 44645.40625 | 93.56 |
| 44645.416666666664 | 160.61 |
| 44645.427083333336 | 50.6 |
| 44645.4375 | 64.49 |
| 44645.447916666664 | 113.19 |
| 44645.458333333336 | 53.94 |
| 44645.46875 | 23.91 |
| 44645.479166666664 | 28.13 |
| 44645.489583333336 | 95.87 |
| 44645.5 | 18.93 |
| 44645.510416666664 | 28.22 |
| 44645.520833333336 | 17.4 |
| 44645.53125 | 16.92 |
| 44645.541666666664 | 30.16 |
| 44645.552083333336 | 19.36 |
| 44645.5625 | 19.76 |
| 44645.572916666664 | 17.37 |
| 44645.583333333336 | 23.11 |
| 44645.59375 | 17.31 |
| 44645.604166666664 | 16.09 |
| 44645.614583333336 | 103.36 |
| 44645.625 | 16.24 |
| 44645.635416666664 | 13.72 |
| 44645.645833333336 | 286.67 |
| 44645.65625 | 13.05 |
| 44645.666666666664 | 11.41 |
| 44645.677083333336 | 11.77 |
| 44645.6875 | 9.51 |
| 44645.697916666664 | 9.29 |
| 44645.708333333336 | 11.46 |
| 44645.71875 | 7.48 |
| 44645.729166666664 | 9.12 |
| 44645.739583333336 | 10.62 |
| 44645.75 | 6.18 |
| 44645.760416666664 | 6.69 |
| 44645.770833333336 | 5.42 |
| 44645.78125 | 4.66 |
| 44645.791666666664 | 5.82 |
| 44645.802083333336 | 5.77 |
| 44645.8125 | 9.02 |
| 44645.822916666664 | 34.37 |
| 44645.833333333336 | 7.55 |
| 44645.84375 | 6.98 |
| 44645.854166666664 | 5.39 |
| 44645.864583333336 | 3.75 |
| 44645.875 | 16.28 |
| 44645.885416666664 | 5.62 |
| 44645.895833333336 | 6.21 |
| 44645.90625 | 7.15 |
| 44645.916666666664 | 7.01 |
| 44645.927083333336 | 19 |
| 44645.9375 | 8.67 |
| 44645.947916666664 | 13.09 |
| 44645.958333333336 | 8.49 |
| 44645.96875 | 8.54 |
| 44645.979166666664 | 10.03 |
| 44645.989583333336 | 38.84 |
| 44646.0 | 8.09 |
| 44646.010416666664 | 10.66 |
| 44646.020833333336 | 105.89 |
| 44646.03125 | 13.71 |
| 44646.041666666664 | 17.04 |
| 44646.052083333336 | 40.56 |
| 44646.0625 | 33.87 |
| 44646.072916666664 | 12.97 |
| 44646.083333333336 | 13.1 |
| 44646.09375 | 11.57 |
| 44646.104166666664 | 13.43 |
| 44646.114583333336 | 11.11 |
| 44646.125 | 6.75 |
| 44646.135416666664 | 9.74 |
| 44646.145833333336 | 7.96 |
| 44646.15625 | 10.76 |
| 44646.166666666664 | 29.15 |
| 44646.177083333336 | 5.84 |
| 44646.1875 | 6.12 |
| 44646.197916666664 | 5.59 |
| 44646.208333333336 | 5.1 |
| 44646.21875 | 5.67 |
| 44646.229166666664 | 4.49 |
| 44646.239583333336 | 4.27 |
| 44646.25 | 3.98 |
| 44646.260416666664 | 4.38 |
| 44646.270833333336 | 3.65 |
| 44646.28125 | 4.78 |
| 44646.291666666664 | 3.42 |
| 44646.302083333336 | 3.81 |
| 44646.3125 | 3.54 |
| 44646.322916666664 | 3.21 |
| 44646.333333333336 | 3.23 |
| 44646.34375 | 3.68 |
| 44646.354166666664 | 3.6 |
| 44646.364583333336 | 4.3 |
| 44646.375 | 3.99 |
| 44646.385416666664 | 3.98 |
| 44646.395833333336 | 4.87 |
| 44646.40625 | 3.71 |
| 44646.416666666664 | 398.21 |
| 44646.427083333336 | 26.08 |
| 44646.4375 | 460.23 |
| 44646.447916666664 | 5.22 |
| 44646.458333333336 | 6.49 |
| 44646.46875 | 27.76 |
| 44646.479166666664 | 220.71 |
| 44646.489583333336 | 513.07 |
| 44646.5 | 36.5 |
| 44646.510416666664 | 53.96 |
| 44646.520833333336 | 15.73 |
| 44646.53125 | 52.96 |
| 44646.541666666664 | 10.27 |
| 44646.552083333336 | 61.96 |
| 44646.5625 | 48.66 |
| 44646.572916666664 | 11.78 |
| 44646.583333333336 | 16.91 |
| 44646.59375 | 43.48 |
| 44646.604166666664 | 12.39 |
| 44646.614583333336 | 11.39 |
| 44646.625 | 6.22 |
| 44646.635416666664 | 7.94 |
| 44646.645833333336 | 8.37 |
| 44646.65625 | 7.4 |
| 44646.666666666664 | 7.43 |
| 44646.677083333336 | 7.64 |
| 44646.6875 | 6.93 |
| 44646.697916666664 | 6.66 |
| 44646.708333333336 | 6.68 |
| 44646.71875 | 7.12 |
| 44646.729166666664 | 6.04 |
| 44646.739583333336 | 6.73 |
| 44646.75 | 5.65 |
| 44646.760416666664 | 6.09 |
| 44646.770833333336 | 5.42 |
| 44646.78125 | 6.08 |
| 44646.791666666664 | 6.12 |
| 44646.802083333336 | 5.81 |
| 44646.8125 | 5.8 |
| 44646.822916666664 | 5.42 |
| 44646.833333333336 | 6.38 |
| 44646.84375 | 4.93 |
| 44646.854166666664 | 6.52 |
| 44646.864583333336 | 4.97 |
| 44646.875 | 4.45 |
| 44646.885416666664 | 4.79 |
| 44646.895833333336 | 4.8 |
| 44646.90625 | 5.1 |
| 44646.916666666664 | 4.99 |
| 44646.927083333336 | 4.62 |
| 44646.9375 | 5.37 |
| 44646.947916666664 | 229.67 |
| 44646.958333333336 | 5.94 |
| 44646.96875 | 45.52 |
| 44646.979166666664 | 6.26 |
| 44646.989583333336 | 5.3 |
| 44647.0 | 6.57 |
| 44647.010416666664 | 6.66 |
| 44647.020833333336 | 6.75 |
| 44647.03125 | 7.18 |
| 44647.041666666664 | 7.22 |
| 44647.052083333336 | 8.03 |
| 44647.0625 | 7.71 |
| 44647.072916666664 | 8.21 |
| 44647.083333333336 | 6.32 |
| 44647.09375 | 9.91 |
| 44647.104166666664 | 9.25 |
| 44647.114583333336 | 10.78 |
| 44647.125 | 10.07 |
| 44647.135416666664 | 9.75 |
| 44647.145833333336 | 8.59 |
| 44647.15625 | 8.71 |
| 44647.166666666664 | 8.3 |
| 44647.177083333336 | 7.28 |
| 44647.1875 | 6.27 |
| 44647.197916666664 | 6.1 |
| 44647.208333333336 | 6.52 |
| 44647.21875 | 5.74 |
| 44647.229166666664 | 6.08 |
| 44647.239583333336 | 6.31 |
| 44647.25 | 5.13 |
| 44647.260416666664 | 5.15 |
| 44647.270833333336 | 5.04 |
| 44647.28125 | 4.61 |
| 44647.291666666664 | 4.43 |
| 44647.302083333336 | 4.18 |
| 44647.3125 | 4.15 |
| 44647.322916666664 | 4.31 |
| 44647.333333333336 | 4.29 |
| 44647.34375 | 4.35 |
| 44647.354166666664 | 3.76 |
| 44647.364583333336 | 3.8 |
| 44647.375 | 3.96 |
| 44647.385416666664 | 3.95 |
| 44647.395833333336 | 4.7 |
| 44647.40625 | 4.65 |
| 44647.416666666664 | 4.64 |
| 44647.427083333336 | 5.45 |
| 44647.4375 | 4.13 |
| 44647.447916666664 | 4.61 |
| 44647.458333333336 | 5.8 |
| 44647.46875 | 3.85 |
| 44647.479166666664 | 5.31 |
| 44647.489583333336 | 60.54 |
| 44647.5 | 5.52 |
| 44647.510416666664 | 3.83 |
| 44647.520833333336 | 5.9 |
| 44647.53125 | 5.93 |
| 44647.541666666664 | 6.58 |
| 44647.552083333336 | 8.1 |
| 44647.5625 | 9.05 |
| 44647.572916666664 | 120.51 |
| 44647.583333333336 | 8.29 |
| 44647.59375 | 210.57 |
| 44647.604166666664 | 302.89 |
| 44647.614583333336 | 9.44 |
| 44647.625 | 8.35 |
| 44647.635416666664 | 10.19 |
| 44647.645833333336 | 8.24 |
| 44647.65625 | 10.55 |
| 44647.666666666664 | 10.19 |
| 44647.677083333336 | 9.26 |
| 44647.6875 | 7.99 |
| 44647.697916666664 | 9.13 |
| 44647.708333333336 | 8.84 |
| 44647.71875 | 8.01 |
| 44647.729166666664 | 7.43 |
| 44647.739583333336 | 6.96 |
| 44647.75 | 7.74 |
| 44647.760416666664 | 6.78 |
| 44647.770833333336 | 5.68 |
| 44647.78125 | 5.18 |
| 44647.791666666664 | 5.25 |
| 44647.802083333336 | 4.46 |
| 44647.8125 | 4.47 |
| 44647.822916666664 | 4.74 |
| 44647.833333333336 | 4.55 |
| 44647.84375 | 3.95 |
| 44647.854166666664 | 3.44 |
| 44647.864583333336 | 3.59 |
| 44647.875 | 3.46 |
| 44647.885416666664 | 3.47 |
| 44647.895833333336 | 3.83 |
| 44647.90625 | 3.68 |
| 44647.916666666664 | 3.73 |
| 44647.927083333336 | 3.94 |
| 44647.9375 | 3.8 |
| 44647.947916666664 | 3.74 |
| 44647.958333333336 | 3.86 |
| 44647.96875 | 351.72 |
| 44647.979166666664 | 6.7 |
| 44647.989583333336 | 4.37 |
| 44648.0 | 4.68 |
| 44648.010416666664 | 6.76 |
| 44648.020833333336 | 4.57 |
| 44648.03125 | 45.16 |
| 44648.041666666664 | 5.28 |
| 44648.052083333336 | 8.41 |
| 44648.0625 | 6.48 |
| 44648.072916666664 | 6.68 |
| 44648.083333333336 | 7.11 |
| 44648.09375 | 7.57 |
| 44648.104166666664 | 8.03 |
| 44648.114583333336 | 8.65 |
| 44648.125 | 8.51 |
| 44648.135416666664 | 10.85 |
| 44648.145833333336 | 11.83 |
| 44648.15625 | 9.49 |
| 44648.166666666664 | 11.07 |
| 44648.177083333336 | 9.4 |
| 44648.1875 | 9.29 |
| 44648.197916666664 | 8.5 |
| 44648.208333333336 | 7.63 |
| 44648.21875 | 8.76 |
| 44648.229166666664 | 7.55 |
| 44648.239583333336 | 8.34 |
| 44648.25 | 7.47 |
| 44648.260416666664 | 6.71 |
| 44648.270833333336 | 8.22 |
| 44648.28125 | 7.08 |
| 44648.291666666664 | 7.32 |
| 44648.302083333336 | 7.6 |
| 44648.3125 | 6.49 |
| 44648.322916666664 | 8.7 |
| 44648.333333333336 | 7.92 |
| 44648.34375 | 7.23 |
| 44648.354166666664 | 7.05 |
| 44648.364583333336 | 7.61 |
| 44648.375 | 6.98 |
| 44648.385416666664 | 6.73 |
| 44648.395833333336 | 6.95 |
| 44648.40625 | 6.4 |
| 44648.416666666664 | 6.49 |
| 44648.427083333336 | 6.03 |
| 44648.4375 | 6.15 |
| 44648.447916666664 | 6.55 |
| 44648.458333333336 | 6.09 |
| 44648.46875 | 126.47 |
| 44648.479166666664 | 6.17 |
| 44648.489583333336 | 5.91 |
| 44648.5 | 5.3 |
| 44648.510416666664 | 5.68 |
| 44648.520833333336 | 4.14 |
| 44648.53125 | 6.51 |
| 44648.541666666664 | 4.87 |
| 44648.552083333336 | 5.44 |
| 44648.5625 | 5.34 |
| 44648.572916666664 | 6.1 |
| 44648.583333333336 | 6.48 |
| 44648.59375 | 3.72 |
| 44648.604166666664 | 6.88 |
| 44648.614583333336 | 7.2 |
| 44648.625 | 7.95 |
| 44648.635416666664 | 7.65 |
| 44648.645833333336 | 7.32 |
| 44648.65625 | 7.02 |
| 44648.666666666664 | 7.82 |
| 44648.677083333336 | 513.4 |
| 44648.6875 | 8.7 |
| 44648.697916666664 | 9.21 |
| 44648.708333333336 | 8.71 |
| 44648.71875 | 7.39 |
| 44648.729166666664 | 7.88 |
| 44648.739583333336 | 8.1 |
| 44648.75 | 8.52 |
| 44648.760416666664 | 7.75 |
| 44648.770833333336 | 6.31 |
| 44648.78125 | 6.83 |
| 44648.791666666664 | 6.96 |
| 44648.802083333336 | 6.47 |
| 44648.8125 | 6.12 |
| 44648.822916666664 | 6.02 |
| 44648.833333333336 | 5.36 |
| 44648.84375 | 5.47 |
| 44648.854166666664 | 4.89 |
| 44648.864583333336 | 4.97 |
| 44648.875 | 4.69 |
| 44648.885416666664 | 4.75 |
| 44648.895833333336 | 4.56 |
| 44648.90625 | 4.7 |
| 44648.916666666664 | 4.5 |
| 44648.927083333336 | 4.89 |
| 44648.9375 | 4.94 |
| 44648.947916666664 | 4.72 |
| 44648.958333333336 | 5.22 |
| 44648.96875 | 5.1 |
| 44648.979166666664 | 4.93 |
| 44648.989583333336 | 4.78 |
| 44649.0 | 6.2 |
| 44649.010416666664 | 6.03 |
| 44649.020833333336 | 11.81 |
| 44649.03125 | 7.32 |
| 44649.041666666664 | 7.26 |
| 44649.052083333336 | 15.48 |
| 44649.0625 | 26.35 |
| 44649.072916666664 | 10.4 |
| 44649.083333333336 | 9.2 |
| 44649.09375 | 11.79 |
| 44649.104166666664 | 11.81 |
| 44649.114583333336 | 14.05 |
| 44649.125 | 11.59 |
| 44649.135416666664 | 14.72 |
| 44649.145833333336 | 13.79 |
| 44649.15625 | 12.71 |
| 44649.166666666664 | 11.48 |
| 44649.177083333336 | 13.47 |
| 44649.1875 | 9.19 |
| 44649.197916666664 | 10.33 |
| 44649.208333333336 | 11.33 |
| 44649.21875 | 9.79 |
| 44649.229166666664 | 9.08 |
| 44649.239583333336 | 10.05 |
| 44649.25 | 9.26 |
| 44649.260416666664 | 9.44 |
| 44649.270833333336 | 10.1 |
| 44649.28125 | 10.53 |
| 44649.291666666664 | 10.35 |
| 44649.302083333336 | 10.25 |
| 44649.3125 | 9.66 |
| 44649.322916666664 | 10.25 |
| 44649.333333333336 | 9.43 |
| 44649.34375 | 8.5 |
| 44649.354166666664 | 10.02 |
| 44649.364583333336 | 6.54 |
| 44649.375 | 8.01 |
| 44649.385416666664 | 8.2 |
| 44649.395833333336 | 6.77 |
| 44649.40625 | 7.12 |
| 44649.416666666664 | 7.6 |
| 44649.427083333336 | 7.59 |
| 44649.4375 | 7.6 |
| 44649.447916666664 | 8.78 |
| 44649.458333333336 | 6.42 |
| 44649.46875 | 7.88 |
| 44649.479166666664 | 6.58 |
| 44649.489583333336 | 7.29 |
| 44649.5 | 7.26 |
| 44649.510416666664 | 7.18 |
| 44649.520833333336 | 7.06 |
| 44649.53125 | 6.27 |
| 44649.541666666664 | 5.47 |
| 44649.552083333336 | 7.04 |
| 44649.5625 | 8.14 |
| 44649.572916666664 | 7.02 |
| 44649.583333333336 | 13.29 |
| 44649.59375 | 7.7 |
| 44649.604166666664 | 8.21 |
| 44649.614583333336 | 412.88 |
| 44649.625 | 118.15 |
| 44649.635416666664 | 8.58 |
| 44649.645833333336 | 8.49 |
| 44649.65625 | 8.66 |
| 44649.666666666664 | 55.03 |
| 44649.677083333336 | 11.35 |
| 44649.6875 | 9.62 |
| 44649.697916666664 | 18.08 |
| 44649.708333333336 | 9.68 |
| 44649.71875 | 7.4 |
| 44649.729166666664 | 9 |
| 44649.739583333336 | 10.52 |
| 44649.75 | 10 |
| 44649.760416666664 | 9.24 |
| 44649.770833333336 | 8.57 |
| 44649.78125 | 9.32 |
| 44649.791666666664 | 9.05 |
| 44649.802083333336 | 9.46 |
| 44649.8125 | 9.56 |
| 44649.822916666664 | 9.72 |
| 44649.833333333336 | 7.48 |
| 44649.84375 | 6.64 |
| 44649.854166666664 | 7.03 |
| 44649.864583333336 | 7.98 |
| 44649.875 | 6.17 |
| 44649.885416666664 | 6.52 |
| 44649.895833333336 | 6.8 |
| 44649.90625 | 5.81 |
| 44649.916666666664 | 4.93 |
| 44649.927083333336 | 4.92 |
| 44649.9375 | 6.99 |
| 44649.947916666664 | 7.28 |
| 44649.958333333336 | 8.11 |
| 44649.96875 | 6.87 |
| 44649.979166666664 | 6.62 |
| 44649.989583333336 | 6.17 |
| 44650.0 | 6.29 |
| 44650.010416666664 | 6.75 |
| 44650.020833333336 | 7.52 |
| 44650.03125 | 7.32 |
| 44650.041666666664 | 3.66 |
| 44650.052083333336 | 5.69 |
| 44650.0625 | 6.61 |
| 44650.072916666664 | 10.47 |
| 44650.083333333336 | 5.1 |
| 44650.09375 | 6.85 |
| 44650.104166666664 | 7.07 |
| 44650.114583333336 | 6.87 |
| 44650.125 | 9.18 |
| 44650.135416666664 | 5.89 |
| 44650.145833333336 | 8.4 |
| 44650.15625 | 14.57 |
| 44650.166666666664 | 13.25 |
| 44650.177083333336 | 7.73 |
| 44650.1875 | 12.61 |
| 44650.197916666664 | 12.9 |
| 44650.208333333336 | 13.33 |
| 44650.21875 | 12.05 |
| 44650.229166666664 | 11.06 |
| 44650.239583333336 | 13.06 |
| 44650.25 | 13.38 |
| 44650.260416666664 | 14.63 |
| 44650.270833333336 | 11.06 |
| 44650.28125 | 9.98 |
| 44650.291666666664 | 314.36 |
| 44650.302083333336 | 9.26 |
| 44650.3125 | 8.97 |
| 44650.322916666664 | 10.35 |
| 44650.333333333336 | 8.44 |
| 44650.34375 | 7.99 |
| 44650.354166666664 | 8.21 |
| 44650.364583333336 | 6.53 |
| 44650.375 | 6.81 |
| 44650.385416666664 | 53.99 |
| 44650.395833333336 | 514.34 |
| 44650.40625 | 7.22 |
| 44650.416666666664 | 27.7 |
| 44650.427083333336 | 6.66 |
| 44650.4375 | 12.07 |
| 44650.447916666664 | 5.16 |
| 44650.458333333336 | 9.74 |
| 44650.46875 | 514.38 |
| 44650.479166666664 | 7.58 |
| 44650.489583333336 | 6.9 |
| 44650.5 | 7.04 |
| 44650.510416666664 | 6.53 |
| 44650.520833333336 | 6 |
| 44650.53125 | 6.83 |
| 44650.541666666664 | 5.6 |
| 44650.552083333336 | 6.81 |
| 44650.5625 | 8.55 |
| 44650.572916666664 | 8.07 |
| 44650.583333333336 | 5.59 |
| 44650.59375 | 6.55 |
| 44650.604166666664 | 4.1 |
| 44650.614583333336 | 513.31 |
| 44650.625 | 513.7 |
| 44650.635416666664 | 191.81 |
| 44650.645833333336 | 6.84 |
| 44650.65625 | 11.71 |
| 44650.666666666664 | 10.26 |
| 44650.677083333336 | 269.5 |
| 44650.6875 | 9.38 |
| 44650.697916666664 | 6.84 |
| 44650.708333333336 | 7.38 |
| 44650.71875 | 77.78 |
| 44650.729166666664 | 7.17 |
| 44650.739583333336 | 7.19 |
| 44650.75 | 6.97 |
| 44650.760416666664 | 8.25 |
| 44650.770833333336 | 8.16 |
| 44650.78125 | 7.98 |
| 44650.791666666664 | 8.21 |
| 44650.802083333336 | 7.51 |
| 44650.8125 | 6.45 |
| 44650.822916666664 | 7.78 |
| 44650.833333333336 | 7.44 |
| 44650.84375 | 7.13 |
| 44650.854166666664 | 5.91 |
| 44650.864583333336 | 6.4 |
| 44650.875 | 5.99 |
| 44650.885416666664 | 5.76 |
| 44650.895833333336 | 6.41 |
| 44650.90625 | 5.91 |
| 44650.916666666664 | 6.24 |
| 44650.927083333336 | 5.89 |
| 44650.9375 | 5.84 |
| 44650.947916666664 | 6.01 |
| 44650.958333333336 | 6.19 |
| 44650.96875 | 6.02 |
| 44650.979166666664 | 6.24 |
| 44650.989583333336 | 6.06 |
| 44651.0 | 6.11 |
| 44651.010416666664 | 5.95 |
| 44651.020833333336 | 5.89 |
| 44651.03125 | 5.81 |
| 44651.041666666664 | 5.87 |
| 44651.052083333336 | 6.12 |
| 44651.0625 | 5.89 |
| 44651.072916666664 | 6.34 |
| 44651.083333333336 | 5.86 |
| 44651.09375 | 5.79 |
| 44651.104166666664 | 5.93 |
| 44651.114583333336 | 5.65 |
| 44651.125 | 5.38 |
| 44651.135416666664 | 6.11 |
| 44651.145833333336 | 6.47 |
| 44651.15625 | 6.72 |
| 44651.166666666664 | 6.99 |
| 44651.177083333336 | 8.04 |
| 44651.1875 | 8.21 |
| 44651.197916666664 | 8.41 |
| 44651.208333333336 | 8.47 |
| 44651.21875 | 8.65 |
| 44651.229166666664 | 8.53 |
| 44651.239583333336 | 9.14 |
| 44651.25 | 9.11 |
| 44651.260416666664 | 8.83 |
| 44651.270833333336 | 9.11 |
| 44651.28125 | 9.11 |
| 44651.291666666664 | 9.61 |
| 44651.302083333336 | 8.85 |
| 44651.3125 | 8.85 |
| 44651.322916666664 | 8.72 |
| 44651.333333333336 | 8.35 |
| 44651.34375 | 8.85 |
| 44651.354166666664 | 8.34 |
| 44651.364583333336 | 8.23 |
| 44651.375 | 7.59 |
| 44651.385416666664 | 7.58 |
| 44651.395833333336 | 7.59 |
| 44651.40625 | 7.62 |
| 44651.416666666664 | 7.37 |
| 44651.427083333336 | 7.41 |
| 44651.4375 | 7.45 |
| 44651.447916666664 | 7.01 |
| 44651.458333333336 | 7.01 |
| 44651.46875 | 7.2 |
| 44651.479166666664 | 7.21 |
| 44651.489583333336 | 6.86 |
| 44651.5 | 6.8 |
| 44651.510416666664 | 6.83 |
| 44651.520833333336 | 6.6 |
| 44651.53125 | 6.38 |
| 44651.541666666664 | 6.41 |
| 44651.552083333336 | 6.11 |
| 44651.5625 | 6.02 |
| 44651.572916666664 | 5.83 |
| 44651.583333333336 | 5.69 |
| 44651.59375 | 5.8 |
| 44651.604166666664 | 6.01 |
| 44651.614583333336 | 5.74 |
| 44651.625 | 5.77 |
| 44651.635416666664 | 5.46 |
| 44651.645833333336 | 5.63 |
| 44651.65625 | 4.83 |
| 44651.666666666664 | 6.1 |
| 44651.677083333336 | 5.11 |
| 44651.6875 | 5.68 |
| 44651.697916666664 | 7.41 |
| 44651.708333333336 | 8.11 |
| 44651.71875 | 8.14 |
| 44651.729166666664 | 7.12 |
| 44651.739583333336 | 7.54 |
| 44651.75 | 8.07 |
| 44651.760416666664 | 8.41 |
| 44651.770833333336 | 8.2 |
| 44651.78125 | 8.14 |
| 44651.791666666664 | 9.21 |
| 44651.802083333336 | 8.52 |
| 44651.8125 | 9.02 |
| 44651.822916666664 | 8.51 |
| 44651.833333333336 | 8.29 |
| 44651.84375 | 7.9 |
| 44651.854166666664 | 8.04 |
| 44651.864583333336 | 9.5 |
| 44651.875 | 9.78 |
| 44651.885416666664 | 10.71 |
| 44651.895833333336 | 10.19 |
| 44651.90625 | 11.25 |
| 44651.916666666664 | 10.64 |
| 44651.927083333336 | 10.82 |
| 44651.9375 | 10.6 |
| 44651.947916666664 | 10.53 |
| 44651.958333333336 | 11.04 |
| 44651.96875 | 10.26 |
| 44651.979166666664 | 10.18 |
| 44651.989583333336 | 10.42 |
| 44652.0 | 11.28 |
| 44652.010416666664 | 11.18 |
| 44652.020833333336 | 9.66 |
| 44652.03125 | 9.52 |
| 44652.041666666664 | 9.34 |
| 44652.052083333336 | 8.65 |
| 44652.0625 | 8.59 |
| 44652.072916666664 | 8.85 |
| 44652.083333333336 | 8.06 |
| 44652.09375 | 7.83 |
| 44652.104166666664 | 7.3 |
| 44652.114583333336 | 7.61 |
| 44652.125 | 7.67 |
| 44652.135416666664 | 7.47 |
| 44652.145833333336 | 7.88 |